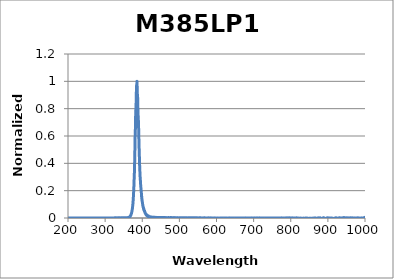
| Category | Normalized Intensity |
|---|---|
| 199.97546 | 0 |
| 200.17692 | 0 |
| 200.37839 | 0 |
| 200.57989 | 0 |
| 200.7814 | 0 |
| 200.98293 | 0 |
| 201.18448 | 0 |
| 201.38605 | 0 |
| 201.58764 | 0 |
| 201.78925 | 0 |
| 201.99087 | 0 |
| 202.19252 | 0 |
| 202.39418 | 0 |
| 202.59586 | 0 |
| 202.79756 | 0 |
| 202.99928 | 0 |
| 203.20102 | 0 |
| 203.40278 | 0 |
| 203.60455 | 0 |
| 203.80635 | 0 |
| 204.00816 | 0 |
| 204.20999 | 0 |
| 204.41184 | 0 |
| 204.61371 | 0 |
| 204.8156 | 0 |
| 205.0175 | 0 |
| 205.21943 | 0 |
| 205.42137 | 0 |
| 205.62334 | 0 |
| 205.82532 | 0 |
| 206.02732 | 0 |
| 206.22934 | 0 |
| 206.43137 | 0 |
| 206.63343 | 0 |
| 206.83551 | 0 |
| 207.0376 | 0 |
| 207.23971 | 0 |
| 207.44184 | 0 |
| 207.64399 | 0 |
| 207.84616 | 0 |
| 208.04835 | 0 |
| 208.25055 | 0 |
| 208.45278 | 0 |
| 208.65502 | 0 |
| 208.85728 | 0 |
| 209.05956 | 0 |
| 209.26186 | 0 |
| 209.46418 | 0 |
| 209.66651 | 0 |
| 209.86887 | 0 |
| 210.07124 | 0 |
| 210.27363 | 0 |
| 210.47604 | 0 |
| 210.67847 | 0 |
| 210.88092 | 0 |
| 211.08338 | 0 |
| 211.28587 | 0 |
| 211.48837 | 0 |
| 211.69089 | 0 |
| 211.89343 | 0 |
| 212.09599 | 0 |
| 212.29857 | 0 |
| 212.50117 | 0 |
| 212.70378 | 0 |
| 212.90641 | 0 |
| 213.10907 | 0 |
| 213.31174 | 0 |
| 213.51442 | 0 |
| 213.71713 | 0 |
| 213.91986 | 0 |
| 214.1226 | 0 |
| 214.32537 | 0 |
| 214.52815 | 0 |
| 214.73095 | 0 |
| 214.93376 | 0 |
| 215.1366 | 0 |
| 215.33946 | 0 |
| 215.54233 | 0 |
| 215.74522 | 0 |
| 215.94813 | 0 |
| 216.15106 | 0 |
| 216.35401 | 0 |
| 216.55698 | 0 |
| 216.75996 | 0 |
| 216.96297 | 0 |
| 217.16599 | 0 |
| 217.36903 | 0 |
| 217.57209 | 0 |
| 217.77517 | 0 |
| 217.97826 | 0 |
| 218.18138 | 0 |
| 218.38451 | 0 |
| 218.58766 | 0 |
| 218.79083 | 0 |
| 218.99402 | 0 |
| 219.19722 | 0 |
| 219.40045 | 0 |
| 219.60369 | 0 |
| 219.80695 | 0 |
| 220.01023 | 0 |
| 220.21353 | 0 |
| 220.41685 | 0 |
| 220.62018 | 0 |
| 220.82354 | 0 |
| 221.02691 | 0 |
| 221.2303 | 0 |
| 221.43371 | 0 |
| 221.63713 | 0 |
| 221.84058 | 0 |
| 222.04404 | 0 |
| 222.24753 | 0 |
| 222.45103 | 0 |
| 222.65455 | 0 |
| 222.85808 | 0 |
| 223.06164 | 0 |
| 223.26521 | 0 |
| 223.46881 | 0 |
| 223.67242 | 0 |
| 223.87605 | 0 |
| 224.07969 | 0 |
| 224.28336 | 0 |
| 224.48704 | 0 |
| 224.69075 | 0 |
| 224.89447 | 0 |
| 225.0982 | 0 |
| 225.30196 | 0 |
| 225.50574 | 0 |
| 225.70953 | 0 |
| 225.91334 | 0 |
| 226.11717 | 0 |
| 226.32102 | 0 |
| 226.52489 | 0 |
| 226.72878 | 0 |
| 226.93268 | 0 |
| 227.1366 | 0 |
| 227.34054 | 0 |
| 227.5445 | 0 |
| 227.74848 | 0 |
| 227.95247 | 0 |
| 228.15649 | 0 |
| 228.36052 | 0 |
| 228.56457 | 0 |
| 228.76863 | 0 |
| 228.97272 | 0 |
| 229.17683 | 0 |
| 229.38095 | 0 |
| 229.58509 | 0 |
| 229.78925 | 0 |
| 229.99343 | 0 |
| 230.19762 | 0 |
| 230.40183 | 0 |
| 230.60607 | 0 |
| 230.81032 | 0 |
| 231.01459 | 0 |
| 231.21887 | 0 |
| 231.42318 | 0 |
| 231.6275 | 0 |
| 231.83184 | 0 |
| 232.0362 | 0 |
| 232.24058 | 0 |
| 232.44497 | 0 |
| 232.64939 | 0 |
| 232.85382 | 0 |
| 233.05827 | 0 |
| 233.26274 | 0 |
| 233.46722 | 0 |
| 233.67173 | 0 |
| 233.87625 | 0 |
| 234.08079 | 0 |
| 234.28535 | 0 |
| 234.48993 | 0 |
| 234.69452 | 0 |
| 234.89914 | 0 |
| 235.10377 | 0 |
| 235.30842 | 0 |
| 235.51309 | 0 |
| 235.71777 | 0 |
| 235.92248 | 0 |
| 236.1272 | 0 |
| 236.33194 | 0 |
| 236.5367 | 0 |
| 236.74147 | 0 |
| 236.94627 | 0 |
| 237.15108 | 0 |
| 237.35591 | 0 |
| 237.56076 | 0 |
| 237.76563 | 0 |
| 237.97051 | 0 |
| 238.17541 | 0 |
| 238.38033 | 0 |
| 238.58527 | 0 |
| 238.79023 | 0 |
| 238.9952 | 0 |
| 239.2002 | 0 |
| 239.40521 | 0 |
| 239.61024 | 0 |
| 239.81529 | 0 |
| 240.02035 | 0 |
| 240.22543 | 0 |
| 240.43053 | 0 |
| 240.63565 | 0 |
| 240.84079 | 0 |
| 241.04595 | 0 |
| 241.25112 | 0 |
| 241.45631 | 0 |
| 241.66152 | 0 |
| 241.86675 | 0 |
| 242.07199 | 0 |
| 242.27726 | 0 |
| 242.48254 | 0 |
| 242.68784 | 0 |
| 242.89315 | 0 |
| 243.09849 | 0 |
| 243.30384 | 0 |
| 243.50921 | 0 |
| 243.7146 | 0 |
| 243.92001 | 0 |
| 244.12543 | 0 |
| 244.33087 | 0 |
| 244.53633 | 0 |
| 244.74181 | 0 |
| 244.94731 | 0 |
| 245.15282 | 0 |
| 245.35836 | 0 |
| 245.56391 | 0 |
| 245.76948 | 0 |
| 245.97506 | 0 |
| 246.18067 | 0 |
| 246.38629 | 0 |
| 246.59193 | 0 |
| 246.79758 | 0 |
| 247.00326 | 0 |
| 247.20895 | 0 |
| 247.41466 | 0 |
| 247.62039 | 0 |
| 247.82614 | 0 |
| 248.03191 | 0 |
| 248.23769 | 0 |
| 248.44349 | 0 |
| 248.64931 | 0 |
| 248.85514 | 0 |
| 249.061 | 0 |
| 249.26687 | 0 |
| 249.47276 | 0 |
| 249.67867 | 0 |
| 249.88459 | 0 |
| 250.09054 | 0 |
| 250.2965 | 0 |
| 250.50248 | 0 |
| 250.70847 | 0 |
| 250.91449 | 0 |
| 251.12052 | 0 |
| 251.32657 | 0 |
| 251.53264 | 0 |
| 251.73872 | 0 |
| 251.94483 | 0 |
| 252.15095 | 0 |
| 252.35709 | 0 |
| 252.56325 | 0 |
| 252.76942 | 0 |
| 252.97561 | 0 |
| 253.18182 | 0 |
| 253.38805 | 0 |
| 253.5943 | 0 |
| 253.80056 | 0 |
| 254.00684 | 0 |
| 254.21314 | 0 |
| 254.41946 | 0 |
| 254.62579 | 0 |
| 254.83214 | 0 |
| 255.03851 | 0 |
| 255.2449 | 0 |
| 255.45131 | 0 |
| 255.65773 | 0 |
| 255.86417 | 0 |
| 256.07063 | 0 |
| 256.27711 | 0 |
| 256.4836 | 0 |
| 256.69011 | 0 |
| 256.89664 | 0 |
| 257.10319 | 0 |
| 257.30975 | 0 |
| 257.51634 | 0 |
| 257.72294 | 0 |
| 257.92955 | 0 |
| 258.13619 | 0 |
| 258.34284 | 0 |
| 258.54951 | 0 |
| 258.7562 | 0 |
| 258.96291 | 0 |
| 259.16963 | 0 |
| 259.37637 | 0 |
| 259.58313 | 0 |
| 259.78991 | 0 |
| 259.9967 | 0 |
| 260.20351 | 0 |
| 260.41034 | 0 |
| 260.61719 | 0 |
| 260.82406 | 0 |
| 261.03094 | 0 |
| 261.23784 | 0 |
| 261.44476 | 0 |
| 261.65169 | 0 |
| 261.85864 | 0 |
| 262.06561 | 0 |
| 262.2726 | 0 |
| 262.47961 | 0 |
| 262.68663 | 0 |
| 262.89367 | 0 |
| 263.10073 | 0 |
| 263.30781 | 0 |
| 263.5149 | 0 |
| 263.72201 | 0 |
| 263.92914 | 0 |
| 264.13629 | 0 |
| 264.34345 | 0 |
| 264.55063 | 0 |
| 264.75783 | 0 |
| 264.96505 | 0 |
| 265.17228 | 0 |
| 265.37953 | 0 |
| 265.5868 | 0 |
| 265.79409 | 0 |
| 266.00139 | 0 |
| 266.20871 | 0 |
| 266.41605 | 0 |
| 266.62341 | 0 |
| 266.83078 | 0 |
| 267.03817 | 0 |
| 267.24558 | 0 |
| 267.45301 | 0 |
| 267.66045 | 0 |
| 267.86791 | 0 |
| 268.07539 | 0 |
| 268.28289 | 0 |
| 268.4904 | 0 |
| 268.69793 | 0 |
| 268.90548 | 0 |
| 269.11305 | 0 |
| 269.32063 | 0 |
| 269.52823 | 0 |
| 269.73585 | 0 |
| 269.94349 | 0 |
| 270.15114 | 0 |
| 270.35881 | 0 |
| 270.5665 | 0 |
| 270.77421 | 0 |
| 270.98193 | 0 |
| 271.18967 | 0 |
| 271.39743 | 0 |
| 271.60521 | 0 |
| 271.813 | 0 |
| 272.02081 | 0 |
| 272.22864 | 0 |
| 272.43648 | 0 |
| 272.64434 | 0 |
| 272.85222 | 0 |
| 273.06012 | 0 |
| 273.26804 | 0 |
| 273.47597 | 0 |
| 273.68392 | 0 |
| 273.89188 | 0 |
| 274.09987 | 0 |
| 274.30787 | 0 |
| 274.51589 | 0 |
| 274.72392 | 0 |
| 274.93198 | 0 |
| 275.14005 | 0 |
| 275.34814 | 0 |
| 275.55624 | 0 |
| 275.76437 | 0 |
| 275.97251 | 0 |
| 276.18066 | 0 |
| 276.38884 | 0 |
| 276.59703 | 0 |
| 276.80524 | 0 |
| 277.01347 | 0 |
| 277.22171 | 0 |
| 277.42997 | 0 |
| 277.63825 | 0 |
| 277.84655 | 0 |
| 278.05486 | 0 |
| 278.26319 | 0 |
| 278.47154 | 0 |
| 278.6799 | 0 |
| 278.88829 | 0 |
| 279.09669 | 0 |
| 279.3051 | 0 |
| 279.51354 | 0 |
| 279.72199 | 0 |
| 279.93046 | 0 |
| 280.13894 | 0 |
| 280.34745 | 0 |
| 280.55597 | 0 |
| 280.7645 | 0 |
| 280.97306 | 0 |
| 281.18163 | 0 |
| 281.39022 | 0 |
| 281.59883 | 0 |
| 281.80745 | 0 |
| 282.01609 | 0 |
| 282.22475 | 0 |
| 282.43342 | 0 |
| 282.64212 | 0 |
| 282.85083 | 0 |
| 283.05955 | 0 |
| 283.2683 | 0 |
| 283.47706 | 0 |
| 283.68584 | 0 |
| 283.89463 | 0 |
| 284.10345 | 0 |
| 284.31228 | 0 |
| 284.52112 | 0 |
| 284.72999 | 0 |
| 284.93887 | 0 |
| 285.14777 | 0 |
| 285.35668 | 0 |
| 285.56562 | 0 |
| 285.77457 | 0 |
| 285.98353 | 0 |
| 286.19252 | 0 |
| 286.40152 | 0 |
| 286.61054 | 0 |
| 286.81957 | 0 |
| 287.02863 | 0 |
| 287.2377 | 0 |
| 287.44678 | 0 |
| 287.65589 | 0 |
| 287.86501 | 0 |
| 288.07415 | 0 |
| 288.2833 | 0 |
| 288.49248 | 0 |
| 288.70167 | 0 |
| 288.91087 | 0 |
| 289.1201 | 0 |
| 289.32934 | 0 |
| 289.53859 | 0 |
| 289.74787 | 0 |
| 289.95716 | 0 |
| 290.16647 | 0 |
| 290.3758 | 0 |
| 290.58514 | 0 |
| 290.7945 | 0 |
| 291.00388 | 0 |
| 291.21327 | 0 |
| 291.42268 | 0 |
| 291.63211 | 0 |
| 291.84156 | 0 |
| 292.05102 | 0 |
| 292.2605 | 0 |
| 292.47 | 0 |
| 292.67951 | 0 |
| 292.88904 | 0 |
| 293.09859 | 0 |
| 293.30815 | 0 |
| 293.51773 | 0 |
| 293.72733 | 0 |
| 293.93695 | 0 |
| 294.14658 | 0 |
| 294.35623 | 0 |
| 294.56589 | 0 |
| 294.77558 | 0 |
| 294.98528 | 0 |
| 295.195 | 0 |
| 295.40473 | 0 |
| 295.61448 | 0 |
| 295.82425 | 0 |
| 296.03403 | 0 |
| 296.24384 | 0 |
| 296.45366 | 0 |
| 296.66349 | 0 |
| 296.87334 | 0 |
| 297.08321 | 0 |
| 297.2931 | 0 |
| 297.503 | 0 |
| 297.71292 | 0 |
| 297.92286 | 0 |
| 298.13282 | 0 |
| 298.34279 | 0 |
| 298.55277 | 0 |
| 298.76278 | 0 |
| 298.9728 | 0 |
| 299.18284 | 0 |
| 299.3929 | 0 |
| 299.60297 | 0 |
| 299.81306 | 0 |
| 300.02316 | 0 |
| 300.23329 | 0 |
| 300.44343 | 0 |
| 300.65358 | 0 |
| 300.86376 | 0 |
| 301.07395 | 0 |
| 301.28416 | 0 |
| 301.49438 | 0 |
| 301.70462 | 0 |
| 301.91488 | 0 |
| 302.12515 | 0 |
| 302.33544 | 0 |
| 302.54575 | 0 |
| 302.75608 | 0 |
| 302.96642 | 0 |
| 303.17678 | 0 |
| 303.38715 | 0 |
| 303.59755 | 0 |
| 303.80796 | 0 |
| 304.01838 | 0 |
| 304.22882 | 0 |
| 304.43928 | 0 |
| 304.64976 | 0 |
| 304.86025 | 0 |
| 305.07076 | 0 |
| 305.28129 | 0 |
| 305.49183 | 0 |
| 305.70239 | 0 |
| 305.91297 | 0 |
| 306.12356 | 0 |
| 306.33417 | 0 |
| 306.5448 | 0 |
| 306.75545 | 0 |
| 306.96611 | 0 |
| 307.17678 | 0 |
| 307.38748 | 0 |
| 307.59819 | 0 |
| 307.80892 | 0 |
| 308.01966 | 0 |
| 308.23042 | 0 |
| 308.4412 | 0 |
| 308.65199 | 0 |
| 308.8628 | 0 |
| 309.07363 | 0 |
| 309.28448 | 0 |
| 309.49534 | 0 |
| 309.70622 | 0 |
| 309.91711 | 0 |
| 310.12802 | 0 |
| 310.33895 | 0 |
| 310.54989 | 0 |
| 310.76085 | 0 |
| 310.97183 | 0 |
| 311.18283 | 0 |
| 311.39384 | 0 |
| 311.60487 | 0 |
| 311.81591 | 0 |
| 312.02697 | 0 |
| 312.23805 | 0 |
| 312.44914 | 0 |
| 312.66025 | 0 |
| 312.87138 | 0 |
| 313.08253 | 0 |
| 313.29369 | 0 |
| 313.50486 | 0 |
| 313.71606 | 0 |
| 313.92727 | 0 |
| 314.1385 | 0 |
| 314.34974 | 0 |
| 314.561 | 0 |
| 314.77228 | 0 |
| 314.98357 | 0 |
| 315.19488 | 0 |
| 315.40621 | 0 |
| 315.61755 | 0 |
| 315.82891 | 0 |
| 316.04029 | 0 |
| 316.25168 | 0 |
| 316.46309 | 0 |
| 316.67452 | 0 |
| 316.88596 | 0 |
| 317.09742 | 0 |
| 317.3089 | 0 |
| 317.52039 | 0 |
| 317.7319 | 0 |
| 317.94342 | 0 |
| 318.15496 | 0 |
| 318.36652 | 0 |
| 318.5781 | 0 |
| 318.78969 | 0 |
| 319.0013 | 0 |
| 319.21292 | 0 |
| 319.42456 | 0 |
| 319.63622 | 0 |
| 319.84789 | 0 |
| 320.05958 | 0 |
| 320.27129 | 0 |
| 320.48302 | 0 |
| 320.69476 | 0 |
| 320.90651 | 0 |
| 321.11828 | 0 |
| 321.33007 | 0 |
| 321.54188 | 0 |
| 321.7537 | 0 |
| 321.96554 | 0 |
| 322.1774 | 0 |
| 322.38927 | 0 |
| 322.60116 | 0 |
| 322.81306 | 0 |
| 323.02498 | 0 |
| 323.23692 | 0 |
| 323.44887 | 0 |
| 323.66084 | 0 |
| 323.87283 | 0 |
| 324.08483 | 0 |
| 324.29685 | 0 |
| 324.50889 | 0 |
| 324.72094 | 0 |
| 324.93301 | 0.001 |
| 325.14509 | 0 |
| 325.35719 | 0.001 |
| 325.56931 | 0 |
| 325.78145 | 0.001 |
| 325.9936 | 0 |
| 326.20576 | 0 |
| 326.41795 | 0 |
| 326.63015 | 0.001 |
| 326.84236 | -0.001 |
| 327.0546 | 0 |
| 327.26684 | 0 |
| 327.47911 | 0.001 |
| 327.69139 | -0.001 |
| 327.90369 | 0.001 |
| 328.116 | 0 |
| 328.32833 | 0 |
| 328.54068 | -0.001 |
| 328.75304 | 0.001 |
| 328.96542 | 0 |
| 329.17782 | 0.001 |
| 329.39023 | 0 |
| 329.60266 | 0 |
| 329.8151 | -0.001 |
| 330.02756 | 0.001 |
| 330.24004 | -0.001 |
| 330.45253 | 0.001 |
| 330.66504 | -0.001 |
| 330.87757 | 0.001 |
| 331.09011 | 0 |
| 331.30267 | 0.001 |
| 331.51525 | -0.001 |
| 331.72784 | 0.001 |
| 331.94045 | 0 |
| 332.15307 | 0.001 |
| 332.36571 | -0.001 |
| 332.57837 | 0 |
| 332.79104 | 0 |
| 333.00373 | 0.001 |
| 333.21643 | 0 |
| 333.42915 | 0.001 |
| 333.64189 | 0 |
| 333.85464 | 0.001 |
| 334.06741 | 0 |
| 334.2802 | 0 |
| 334.493 | 0 |
| 334.70582 | 0.001 |
| 334.91866 | 0 |
| 335.13151 | 0.002 |
| 335.34437 | 0 |
| 335.55726 | 0 |
| 335.77016 | -0.001 |
| 335.98307 | 0 |
| 336.196 | 0 |
| 336.40895 | 0.001 |
| 336.62192 | 0 |
| 336.8349 | 0.001 |
| 337.04789 | 0 |
| 337.26091 | 0.001 |
| 337.47394 | 0 |
| 337.68698 | 0.001 |
| 337.90004 | -0.001 |
| 338.11312 | 0 |
| 338.32621 | 0 |
| 338.53932 | 0.001 |
| 338.75245 | 0 |
| 338.96559 | 0.001 |
| 339.17875 | -0.001 |
| 339.39192 | 0 |
| 339.60511 | 0 |
| 339.81832 | 0 |
| 340.03154 | 0 |
| 340.24478 | 0.001 |
| 340.45804 | 0 |
| 340.67131 | 0.001 |
| 340.88459 | 0 |
| 341.0979 | 0.001 |
| 341.31122 | 0 |
| 341.52455 | 0.001 |
| 341.7379 | 0 |
| 341.95127 | 0.001 |
| 342.16465 | 0 |
| 342.37805 | 0.001 |
| 342.59147 | -0.001 |
| 342.8049 | 0.001 |
| 343.01835 | 0 |
| 343.23181 | 0.001 |
| 343.44529 | 0 |
| 343.65879 | 0.001 |
| 343.8723 | -0.001 |
| 344.08583 | 0.001 |
| 344.29937 | 0 |
| 344.51293 | 0.001 |
| 344.72651 | -0.001 |
| 344.9401 | 0.001 |
| 345.15371 | 0.001 |
| 345.36733 | 0.002 |
| 345.58097 | -0.001 |
| 345.79463 | 0.001 |
| 346.0083 | -0.001 |
| 346.22199 | 0.001 |
| 346.43569 | 0 |
| 346.64941 | 0.002 |
| 346.86315 | 0 |
| 347.0769 | 0.001 |
| 347.29067 | 0 |
| 347.50446 | 0.002 |
| 347.71826 | 0 |
| 347.93207 | 0.001 |
| 348.1459 | 0 |
| 348.35975 | 0.001 |
| 348.57362 | -0.001 |
| 348.78749 | 0.001 |
| 349.00139 | 0 |
| 349.2153 | 0.001 |
| 349.42923 | 0 |
| 349.64317 | 0.001 |
| 349.85713 | 0 |
| 350.07111 | 0.001 |
| 350.2851 | 0 |
| 350.49911 | 0.001 |
| 350.71313 | -0.001 |
| 350.92717 | 0.001 |
| 351.14122 | 0 |
| 351.3553 | 0.001 |
| 351.56938 | 0 |
| 351.78349 | 0.001 |
| 351.9976 | 0 |
| 352.21174 | 0.001 |
| 352.42589 | 0 |
| 352.64005 | 0.001 |
| 352.85424 | 0.001 |
| 353.06844 | 0.002 |
| 353.28265 | 0 |
| 353.49688 | 0.002 |
| 353.71112 | 0 |
| 353.92539 | 0.001 |
| 354.13966 | 0 |
| 354.35396 | 0.001 |
| 354.56827 | 0 |
| 354.78259 | 0.001 |
| 354.99693 | 0 |
| 355.21129 | 0.001 |
| 355.42566 | 0 |
| 355.64005 | 0.001 |
| 355.85445 | 0 |
| 356.06887 | 0.002 |
| 356.28331 | 0 |
| 356.49776 | 0.001 |
| 356.71223 | 0 |
| 356.92671 | 0.001 |
| 357.14121 | 0 |
| 357.35572 | 0.002 |
| 357.57025 | 0 |
| 357.7848 | 0.001 |
| 357.99936 | 0 |
| 358.21394 | 0.001 |
| 358.42853 | 0.001 |
| 358.64314 | 0.003 |
| 358.85777 | 0.001 |
| 359.07241 | 0.002 |
| 359.28706 | 0.001 |
| 359.50173 | 0.002 |
| 359.71642 | 0.001 |
| 359.93113 | 0.003 |
| 360.14585 | 0.001 |
| 360.36058 | 0.002 |
| 360.57533 | 0.001 |
| 360.7901 | 0.002 |
| 361.00488 | 0.001 |
| 361.21968 | 0.003 |
| 361.43449 | 0.001 |
| 361.64932 | 0.003 |
| 361.86417 | 0.002 |
| 362.07903 | 0.003 |
| 362.29391 | 0.001 |
| 362.5088 | 0.003 |
| 362.72371 | 0.002 |
| 362.93863 | 0.004 |
| 363.15357 | 0.003 |
| 363.36852 | 0.004 |
| 363.58349 | 0.003 |
| 363.79848 | 0.005 |
| 364.01348 | 0.004 |
| 364.2285 | 0.005 |
| 364.44353 | 0.003 |
| 364.65858 | 0.006 |
| 364.87365 | 0.004 |
| 365.08873 | 0.007 |
| 365.30382 | 0.006 |
| 365.51894 | 0.008 |
| 365.73406 | 0.007 |
| 365.94921 | 0.007 |
| 366.16436 | 0.007 |
| 366.37954 | 0.01 |
| 366.59473 | 0.01 |
| 366.80993 | 0.011 |
| 367.02515 | 0.01 |
| 367.24039 | 0.012 |
| 367.45564 | 0.012 |
| 367.67091 | 0.014 |
| 367.88619 | 0.013 |
| 368.10149 | 0.016 |
| 368.31681 | 0.015 |
| 368.53214 | 0.018 |
| 368.74748 | 0.017 |
| 368.96285 | 0.02 |
| 369.17822 | 0.02 |
| 369.39361 | 0.023 |
| 369.60902 | 0.023 |
| 369.82445 | 0.025 |
| 370.03989 | 0.026 |
| 370.25534 | 0.029 |
| 370.47081 | 0.03 |
| 370.6863 | 0.032 |
| 370.9018 | 0.033 |
| 371.11731 | 0.036 |
| 371.33285 | 0.037 |
| 371.54839 | 0.041 |
| 371.76396 | 0.042 |
| 371.97954 | 0.046 |
| 372.19513 | 0.048 |
| 372.41074 | 0.052 |
| 372.62637 | 0.055 |
| 372.84201 | 0.059 |
| 373.05766 | 0.062 |
| 373.27334 | 0.066 |
| 373.48902 | 0.07 |
| 373.70473 | 0.076 |
| 373.92044 | 0.079 |
| 374.13618 | 0.086 |
| 374.35193 | 0.091 |
| 374.56769 | 0.098 |
| 374.78347 | 0.102 |
| 374.99927 | 0.109 |
| 375.21508 | 0.116 |
| 375.43091 | 0.126 |
| 375.64675 | 0.133 |
| 375.86261 | 0.143 |
| 376.07848 | 0.152 |
| 376.29437 | 0.162 |
| 376.51027 | 0.172 |
| 376.72619 | 0.186 |
| 376.94213 | 0.196 |
| 377.15808 | 0.211 |
| 377.37404 | 0.225 |
| 377.59002 | 0.239 |
| 377.80602 | 0.258 |
| 378.02203 | 0.277 |
| 378.23806 | 0.286 |
| 378.4541 | 0.3 |
| 378.67016 | 0.314 |
| 378.88623 | 0.337 |
| 379.10232 | 0.363 |
| 379.31842 | 0.39 |
| 379.53454 | 0.414 |
| 379.75068 | 0.443 |
| 379.96683 | 0.47 |
| 380.183 | 0.499 |
| 380.39918 | 0.528 |
| 380.61537 | 0.562 |
| 380.83158 | 0.598 |
| 381.04781 | 0.633 |
| 381.26405 | 0.639 |
| 381.48031 | 0.647 |
| 381.69659 | 0.682 |
| 381.91287 | 0.72 |
| 382.12918 | 0.744 |
| 382.3455 | 0.758 |
| 382.56183 | 0.754 |
| 382.77818 | 0.791 |
| 382.99455 | 0.789 |
| 383.21093 | 0.813 |
| 383.42732 | 0.825 |
| 383.64373 | 0.865 |
| 383.86016 | 0.877 |
| 384.0766 | 0.919 |
| 384.29306 | 0.924 |
| 384.50953 | 0.95 |
| 384.72602 | 0.963 |
| 384.94252 | 0.976 |
| 385.15904 | 0.973 |
| 385.37557 | 0.981 |
| 385.59212 | 0.984 |
| 385.80868 | 1 |
| 386.02526 | 0.975 |
| 386.24186 | 0.964 |
| 386.45847 | 0.95 |
| 386.67509 | 0.952 |
| 386.89173 | 0.905 |
| 387.10839 | 0.895 |
| 387.32506 | 0.877 |
| 387.54174 | 0.888 |
| 387.75844 | 0.845 |
| 387.97516 | 0.845 |
| 388.19189 | 0.81 |
| 388.40864 | 0.797 |
| 388.6254 | 0.768 |
| 388.84218 | 0.757 |
| 389.05897 | 0.733 |
| 389.27578 | 0.737 |
| 389.4926 | 0.715 |
| 389.70944 | 0.713 |
| 389.92629 | 0.686 |
| 390.14316 | 0.668 |
| 390.36004 | 0.644 |
| 390.57694 | 0.628 |
| 390.79385 | 0.585 |
| 391.01078 | 0.576 |
| 391.22773 | 0.54 |
| 391.44469 | 0.527 |
| 391.66166 | 0.5 |
| 391.87865 | 0.489 |
| 392.09566 | 0.46 |
| 392.31268 | 0.446 |
| 392.52971 | 0.423 |
| 392.74676 | 0.404 |
| 392.96383 | 0.383 |
| 393.18091 | 0.372 |
| 393.398 | 0.351 |
| 393.61511 | 0.34 |
| 393.83224 | 0.324 |
| 394.04938 | 0.32 |
| 394.26653 | 0.301 |
| 394.48371 | 0.298 |
| 394.70089 | 0.283 |
| 394.91809 | 0.276 |
| 395.13531 | 0.268 |
| 395.35254 | 0.261 |
| 395.56979 | 0.247 |
| 395.78705 | 0.24 |
| 396.00433 | 0.23 |
| 396.22162 | 0.228 |
| 396.43892 | 0.215 |
| 396.65625 | 0.213 |
| 396.87358 | 0.205 |
| 397.09094 | 0.199 |
| 397.3083 | 0.186 |
| 397.52568 | 0.189 |
| 397.74308 | 0.178 |
| 397.96049 | 0.172 |
| 398.17792 | 0.156 |
| 398.39536 | 0.159 |
| 398.61282 | 0.145 |
| 398.83029 | 0.146 |
| 399.04778 | 0.136 |
| 399.26528 | 0.139 |
| 399.4828 | 0.126 |
| 399.70033 | 0.126 |
| 399.91788 | 0.121 |
| 400.13544 | 0.121 |
| 400.35302 | 0.114 |
| 400.57061 | 0.111 |
| 400.78822 | 0.104 |
| 401.00584 | 0.102 |
| 401.22348 | 0.098 |
| 401.44113 | 0.097 |
| 401.6588 | 0.088 |
| 401.87648 | 0.089 |
| 402.09418 | 0.082 |
| 402.31189 | 0.085 |
| 402.52962 | 0.078 |
| 402.74736 | 0.079 |
| 402.96512 | 0.075 |
| 403.18289 | 0.077 |
| 403.40067 | 0.068 |
| 403.61848 | 0.068 |
| 403.83629 | 0.066 |
| 404.05412 | 0.068 |
| 404.27197 | 0.062 |
| 404.48983 | 0.062 |
| 404.70771 | 0.056 |
| 404.9256 | 0.058 |
| 405.14351 | 0.055 |
| 405.36143 | 0.054 |
| 405.57936 | 0.051 |
| 405.79731 | 0.053 |
| 406.01528 | 0.048 |
| 406.23326 | 0.052 |
| 406.45126 | 0.046 |
| 406.66927 | 0.046 |
| 406.88729 | 0.044 |
| 407.10533 | 0.044 |
| 407.32339 | 0.039 |
| 407.54146 | 0.043 |
| 407.75954 | 0.037 |
| 407.97764 | 0.038 |
| 408.19576 | 0.035 |
| 408.41389 | 0.033 |
| 408.63203 | 0.034 |
| 408.85019 | 0.031 |
| 409.06836 | 0.033 |
| 409.28655 | 0.028 |
| 409.50476 | 0.031 |
| 409.72297 | 0.026 |
| 409.94121 | 0.03 |
| 410.15946 | 0.025 |
| 410.37772 | 0.028 |
| 410.596 | 0.024 |
| 410.81429 | 0.026 |
| 411.0326 | 0.021 |
| 411.25092 | 0.025 |
| 411.46925 | 0.022 |
| 411.68761 | 0.024 |
| 411.90597 | 0.019 |
| 412.12435 | 0.023 |
| 412.34275 | 0.018 |
| 412.56116 | 0.02 |
| 412.77959 | 0.016 |
| 412.99803 | 0.02 |
| 413.21648 | 0.017 |
| 413.43495 | 0.019 |
| 413.65344 | 0.015 |
| 413.87193 | 0.018 |
| 414.09045 | 0.016 |
| 414.30898 | 0.017 |
| 414.52752 | 0.013 |
| 414.74608 | 0.015 |
| 414.96465 | 0.012 |
| 415.18324 | 0.015 |
| 415.40184 | 0.013 |
| 415.62046 | 0.015 |
| 415.83909 | 0.011 |
| 416.05774 | 0.014 |
| 416.2764 | 0.012 |
| 416.49508 | 0.014 |
| 416.71377 | 0.011 |
| 416.93247 | 0.015 |
| 417.15119 | 0.01 |
| 417.36993 | 0.011 |
| 417.58868 | 0.01 |
| 417.80744 | 0.012 |
| 418.02622 | 0.01 |
| 418.24501 | 0.011 |
| 418.46382 | 0.008 |
| 418.68264 | 0.012 |
| 418.90148 | 0.007 |
| 419.12033 | 0.01 |
| 419.3392 | 0.008 |
| 419.55808 | 0.01 |
| 419.77698 | 0.008 |
| 419.99589 | 0.009 |
| 420.21481 | 0.006 |
| 420.43375 | 0.009 |
| 420.65271 | 0.007 |
| 420.87167 | 0.008 |
| 421.09066 | 0.006 |
| 421.30966 | 0.009 |
| 421.52867 | 0.005 |
| 421.7477 | 0.008 |
| 421.96674 | 0.006 |
| 422.1858 | 0.008 |
| 422.40487 | 0.006 |
| 422.62395 | 0.007 |
| 422.84305 | 0.005 |
| 423.06217 | 0.007 |
| 423.2813 | 0.005 |
| 423.50044 | 0.006 |
| 423.7196 | 0.004 |
| 423.93878 | 0.007 |
| 424.15796 | 0.004 |
| 424.37717 | 0.007 |
| 424.59638 | 0.004 |
| 424.81561 | 0.007 |
| 425.03486 | 0.004 |
| 425.25412 | 0.007 |
| 425.4734 | 0.003 |
| 425.69269 | 0.007 |
| 425.91199 | 0.003 |
| 426.13131 | 0.006 |
| 426.35064 | 0.005 |
| 426.56999 | 0.006 |
| 426.78935 | 0.004 |
| 427.00873 | 0.005 |
| 427.22812 | 0.003 |
| 427.44753 | 0.006 |
| 427.66695 | 0.003 |
| 427.88638 | 0.005 |
| 428.10583 | 0.003 |
| 428.3253 | 0.005 |
| 428.54477 | 0.002 |
| 428.76427 | 0.005 |
| 428.98377 | 0.003 |
| 429.2033 | 0.006 |
| 429.42283 | 0.004 |
| 429.64238 | 0.005 |
| 429.86195 | 0.001 |
| 430.08153 | 0.005 |
| 430.30112 | 0.001 |
| 430.52073 | 0.005 |
| 430.74035 | 0.003 |
| 430.95999 | 0.005 |
| 431.17964 | 0.002 |
| 431.39931 | 0.004 |
| 431.61899 | 0.002 |
| 431.83868 | 0.004 |
| 432.05839 | 0.002 |
| 432.27812 | 0.005 |
| 432.49785 | 0.003 |
| 432.71761 | 0.005 |
| 432.93737 | 0.002 |
| 433.15716 | 0.004 |
| 433.37695 | 0.001 |
| 433.59676 | 0.004 |
| 433.81659 | 0.002 |
| 434.03643 | 0.004 |
| 434.25628 | 0.001 |
| 434.47615 | 0.005 |
| 434.69603 | 0.001 |
| 434.91593 | 0.004 |
| 435.13584 | 0.002 |
| 435.35576 | 0.003 |
| 435.5757 | 0.001 |
| 435.79565 | 0.003 |
| 436.01562 | 0.001 |
| 436.23561 | 0.004 |
| 436.4556 | 0.001 |
| 436.67561 | 0.003 |
| 436.89564 | 0.001 |
| 437.11568 | 0.003 |
| 437.33573 | 0.002 |
| 437.5558 | 0.005 |
| 437.77589 | 0.001 |
| 437.99598 | 0.004 |
| 438.21609 | 0 |
| 438.43622 | 0.003 |
| 438.65636 | 0.002 |
| 438.87651 | 0.004 |
| 439.09668 | 0.002 |
| 439.31687 | 0.003 |
| 439.53706 | 0.002 |
| 439.75727 | 0.002 |
| 439.9775 | 0.001 |
| 440.19774 | 0.004 |
| 440.41799 | 0 |
| 440.63826 | 0.004 |
| 440.85855 | 0.001 |
| 441.07884 | 0.003 |
| 441.29915 | 0.001 |
| 441.51948 | 0.003 |
| 441.73982 | 0.001 |
| 441.96017 | 0.003 |
| 442.18054 | 0 |
| 442.40092 | 0.003 |
| 442.62132 | 0.001 |
| 442.84173 | 0.003 |
| 443.06216 | 0.001 |
| 443.2826 | 0.004 |
| 443.50305 | 0.001 |
| 443.72352 | 0.002 |
| 443.944 | 0 |
| 444.1645 | 0.002 |
| 444.38501 | 0 |
| 444.60553 | 0.002 |
| 444.82607 | 0.001 |
| 445.04662 | 0.003 |
| 445.26719 | 0 |
| 445.48777 | 0.002 |
| 445.70837 | 0.001 |
| 445.92898 | 0.003 |
| 446.1496 | 0.001 |
| 446.37024 | 0.004 |
| 446.59089 | 0.001 |
| 446.81156 | 0.002 |
| 447.03224 | 0.001 |
| 447.25293 | 0.002 |
| 447.47364 | 0 |
| 447.69436 | 0.003 |
| 447.9151 | 0.001 |
| 448.13585 | 0.002 |
| 448.35662 | 0 |
| 448.5774 | 0.003 |
| 448.79819 | 0.001 |
| 449.019 | 0.004 |
| 449.23982 | 0 |
| 449.46065 | 0.003 |
| 449.6815 | 0.001 |
| 449.90237 | 0.003 |
| 450.12325 | 0.002 |
| 450.34414 | 0.003 |
| 450.56504 | 0 |
| 450.78597 | 0.003 |
| 451.0069 | 0.001 |
| 451.22785 | 0.003 |
| 451.44881 | 0.001 |
| 451.66979 | 0.002 |
| 451.89078 | 0 |
| 452.11178 | 0.003 |
| 452.3328 | 0 |
| 452.55383 | 0.003 |
| 452.77488 | 0 |
| 452.99594 | 0.003 |
| 453.21702 | 0.001 |
| 453.43811 | 0.003 |
| 453.65921 | 0.001 |
| 453.88032 | 0.003 |
| 454.10146 | 0 |
| 454.3226 | 0.002 |
| 454.54376 | 0 |
| 454.76493 | 0.003 |
| 454.98612 | 0.001 |
| 455.20732 | 0.003 |
| 455.42854 | 0.001 |
| 455.64976 | 0.002 |
| 455.87101 | 0 |
| 456.09226 | 0.002 |
| 456.31354 | 0 |
| 456.53482 | 0.003 |
| 456.75612 | 0 |
| 456.97743 | 0.002 |
| 457.19876 | 0.001 |
| 457.4201 | 0.003 |
| 457.64145 | 0.002 |
| 457.86282 | 0.002 |
| 458.08421 | 0 |
| 458.3056 | 0.002 |
| 458.52701 | 0.002 |
| 458.74844 | 0.002 |
| 458.96988 | 0.001 |
| 459.19133 | 0.003 |
| 459.41279 | 0.001 |
| 459.63427 | 0.002 |
| 459.85577 | 0 |
| 460.07728 | 0.002 |
| 460.2988 | 0.001 |
| 460.52033 | 0.003 |
| 460.74188 | 0.002 |
| 460.96345 | 0.002 |
| 461.18502 | 0.001 |
| 461.40662 | 0.002 |
| 461.62822 | 0.001 |
| 461.84984 | 0.002 |
| 462.07147 | 0.001 |
| 462.29312 | 0.003 |
| 462.51478 | 0.001 |
| 462.73645 | 0.003 |
| 462.95814 | 0.001 |
| 463.17984 | 0.002 |
| 463.40156 | 0 |
| 463.62329 | 0.002 |
| 463.84503 | 0.001 |
| 464.06679 | 0.003 |
| 464.28856 | 0 |
| 464.51035 | 0.002 |
| 464.73215 | 0.002 |
| 464.95396 | 0.001 |
| 465.17579 | 0.003 |
| 465.39763 | 0.001 |
| 465.61948 | 0.003 |
| 465.84135 | 0.001 |
| 466.06323 | 0.002 |
| 466.28513 | 0.001 |
| 466.50704 | 0.002 |
| 466.72896 | 0.001 |
| 466.9509 | 0.003 |
| 467.17285 | 0.001 |
| 467.39481 | 0.002 |
| 467.61679 | 0 |
| 467.83878 | 0.002 |
| 468.06079 | 0.001 |
| 468.28281 | 0.002 |
| 468.50484 | 0.001 |
| 468.72689 | 0.002 |
| 468.94895 | 0.001 |
| 469.17103 | 0.002 |
| 469.39312 | 0.002 |
| 469.61522 | 0.002 |
| 469.83733 | 0.001 |
| 470.05946 | 0.003 |
| 470.28161 | 0.001 |
| 470.50376 | 0.003 |
| 470.72594 | 0.001 |
| 470.94812 | 0.002 |
| 471.17032 | 0.001 |
| 471.39253 | 0.003 |
| 471.61476 | 0.001 |
| 471.837 | 0.002 |
| 472.05925 | 0.001 |
| 472.28152 | 0.003 |
| 472.5038 | 0.001 |
| 472.72609 | 0.002 |
| 472.9484 | 0.001 |
| 473.17072 | 0.002 |
| 473.39305 | 0 |
| 473.6154 | 0.002 |
| 473.83777 | 0.001 |
| 474.06014 | 0.001 |
| 474.28253 | 0.001 |
| 474.50494 | 0.002 |
| 474.72735 | 0.001 |
| 474.94978 | 0.002 |
| 475.17223 | 0.001 |
| 475.39469 | 0.003 |
| 475.61716 | 0 |
| 475.83964 | 0.003 |
| 476.06214 | 0.002 |
| 476.28465 | 0.002 |
| 476.50718 | 0 |
| 476.72972 | 0.003 |
| 476.95227 | 0.001 |
| 477.17484 | 0.002 |
| 477.39742 | 0.001 |
| 477.62001 | 0.004 |
| 477.84262 | 0.001 |
| 478.06524 | 0.002 |
| 478.28788 | 0 |
| 478.51053 | 0.002 |
| 478.73319 | 0.001 |
| 478.95586 | 0.002 |
| 479.17855 | 0.001 |
| 479.40126 | 0.003 |
| 479.62397 | 0.001 |
| 479.8467 | 0.002 |
| 480.06945 | 0.001 |
| 480.2922 | 0.003 |
| 480.51497 | 0.001 |
| 480.73776 | 0.002 |
| 480.96056 | 0.001 |
| 481.18337 | 0.002 |
| 481.40619 | 0.001 |
| 481.62903 | 0.002 |
| 481.85188 | 0.001 |
| 482.07475 | 0.002 |
| 482.29763 | 0.001 |
| 482.52052 | 0.002 |
| 482.74342 | 0.001 |
| 482.96634 | 0.002 |
| 483.18928 | 0 |
| 483.41222 | 0.002 |
| 483.63518 | 0.001 |
| 483.85815 | 0.003 |
| 484.08114 | 0 |
| 484.30414 | 0.002 |
| 484.52715 | 0 |
| 484.75018 | 0.002 |
| 484.97322 | 0.001 |
| 485.19628 | 0.002 |
| 485.41934 | 0 |
| 485.64242 | 0.002 |
| 485.86552 | 0.001 |
| 486.08863 | 0.003 |
| 486.31175 | 0 |
| 486.53488 | 0.002 |
| 486.75803 | 0 |
| 486.98119 | 0.002 |
| 487.20437 | 0.001 |
| 487.42756 | 0.002 |
| 487.65076 | 0.001 |
| 487.87397 | 0.002 |
| 488.0972 | 0.001 |
| 488.32044 | 0.002 |
| 488.5437 | 0.001 |
| 488.76697 | 0.002 |
| 488.99025 | 0.001 |
| 489.21354 | 0.002 |
| 489.43685 | 0 |
| 489.66018 | 0.002 |
| 489.88351 | 0.001 |
| 490.10686 | 0.002 |
| 490.33022 | 0 |
| 490.5536 | 0.003 |
| 490.77699 | 0.001 |
| 491.00039 | 0.002 |
| 491.22381 | 0 |
| 491.44724 | 0.002 |
| 491.67068 | 0 |
| 491.89413 | 0.002 |
| 492.1176 | 0.001 |
| 492.34109 | 0.002 |
| 492.56458 | 0.001 |
| 492.78809 | 0.002 |
| 493.01161 | 0 |
| 493.23515 | 0.002 |
| 493.4587 | 0 |
| 493.68226 | 0.002 |
| 493.90584 | 0 |
| 494.12943 | 0.002 |
| 494.35303 | 0 |
| 494.57664 | 0.002 |
| 494.80027 | 0 |
| 495.02391 | 0.002 |
| 495.24757 | 0.001 |
| 495.47124 | 0.002 |
| 495.69492 | 0 |
| 495.91862 | 0.003 |
| 496.14232 | 0.001 |
| 496.36605 | 0.002 |
| 496.58978 | 0.001 |
| 496.81353 | 0.002 |
| 497.03729 | 0 |
| 497.26107 | 0.002 |
| 497.48485 | 0 |
| 497.70866 | 0.002 |
| 497.93247 | 0 |
| 498.1563 | 0.002 |
| 498.38014 | 0.001 |
| 498.60399 | 0.001 |
| 498.82786 | 0.001 |
| 499.05174 | 0.002 |
| 499.27564 | 0.001 |
| 499.49954 | 0.002 |
| 499.72346 | 0.001 |
| 499.9474 | 0.002 |
| 500.17134 | 0.001 |
| 500.3953 | 0.001 |
| 500.61928 | 0.001 |
| 500.84326 | 0.002 |
| 501.06726 | 0.001 |
| 501.29127 | 0.002 |
| 501.5153 | 0 |
| 501.73934 | 0.001 |
| 501.96339 | 0.001 |
| 502.18745 | 0.001 |
| 502.41153 | 0.001 |
| 502.63562 | 0.001 |
| 502.85973 | 0.001 |
| 503.08385 | 0.001 |
| 503.30798 | 0.001 |
| 503.53212 | 0.001 |
| 503.75628 | 0.001 |
| 503.98045 | 0.001 |
| 504.20463 | 0.001 |
| 504.42883 | 0.002 |
| 504.65304 | 0.001 |
| 504.87726 | 0.001 |
| 505.1015 | 0.001 |
| 505.32575 | 0.002 |
| 505.55001 | 0.001 |
| 505.77428 | 0.002 |
| 505.99857 | 0.001 |
| 506.22287 | 0.001 |
| 506.44719 | 0.001 |
| 506.67151 | 0.002 |
| 506.89585 | 0.001 |
| 507.12021 | 0.002 |
| 507.34457 | 0.001 |
| 507.56895 | 0.002 |
| 507.79335 | 0.001 |
| 508.01775 | 0.002 |
| 508.24217 | 0.001 |
| 508.4666 | 0.001 |
| 508.69105 | 0.001 |
| 508.91551 | 0.001 |
| 509.13998 | 0.001 |
| 509.36446 | 0.002 |
| 509.58896 | 0.001 |
| 509.81347 | 0.001 |
| 510.03799 | 0 |
| 510.26253 | 0.002 |
| 510.48708 | 0 |
| 510.71164 | 0.002 |
| 510.93621 | 0 |
| 511.1608 | 0.002 |
| 511.3854 | 0 |
| 511.61002 | 0.002 |
| 511.83464 | 0 |
| 512.05928 | 0.002 |
| 512.28394 | 0 |
| 512.5086 | 0.002 |
| 512.73328 | 0 |
| 512.95797 | 0.002 |
| 513.18268 | 0.001 |
| 513.4074 | 0.001 |
| 513.63213 | 0.001 |
| 513.85687 | 0.002 |
| 514.08163 | 0.001 |
| 514.3064 | 0.001 |
| 514.53118 | 0.001 |
| 514.75597 | 0.001 |
| 514.98078 | 0 |
| 515.2056 | 0.002 |
| 515.43044 | 0 |
| 515.65529 | 0.001 |
| 515.88015 | 0.001 |
| 516.10502 | 0.002 |
| 516.3299 | 0 |
| 516.5548 | 0.002 |
| 516.77972 | 0 |
| 517.00464 | 0.002 |
| 517.22958 | 0 |
| 517.45453 | 0.002 |
| 517.67949 | 0 |
| 517.90447 | 0.001 |
| 518.12946 | 0 |
| 518.35446 | 0.001 |
| 518.57947 | 0 |
| 518.8045 | 0.002 |
| 519.02954 | 0.001 |
| 519.25459 | 0.002 |
| 519.47966 | 0 |
| 519.70474 | 0.001 |
| 519.92983 | 0 |
| 520.15493 | 0.001 |
| 520.38005 | 0.001 |
| 520.60518 | 0.002 |
| 520.83033 | 0 |
| 521.05548 | 0.002 |
| 521.28065 | 0 |
| 521.50583 | 0.001 |
| 521.73103 | 0 |
| 521.95623 | 0 |
| 522.18145 | 0.002 |
| 522.40669 | 0 |
| 522.63193 | 0.002 |
| 522.85719 | 0 |
| 523.08246 | 0.001 |
| 523.30774 | 0 |
| 523.53304 | 0.001 |
| 523.75835 | 0.001 |
| 523.98367 | 0.001 |
| 524.20901 | 0 |
| 524.43436 | 0.001 |
| 524.65972 | 0.001 |
| 524.88509 | 0.002 |
| 525.11048 | 0 |
| 525.33587 | 0.001 |
| 525.56129 | 0 |
| 525.78671 | 0.001 |
| 526.01215 | 0 |
| 526.2376 | 0.001 |
| 526.46306 | -0.001 |
| 526.68853 | 0.001 |
| 526.91402 | 0 |
| 527.13952 | 0.002 |
| 527.36504 | 0.001 |
| 527.59056 | 0.002 |
| 527.8161 | 0 |
| 528.04165 | 0.001 |
| 528.26722 | 0.001 |
| 528.49279 | 0.001 |
| 528.71838 | -0.001 |
| 528.94398 | 0.002 |
| 529.1696 | 0 |
| 529.39523 | 0.001 |
| 529.62087 | 0 |
| 529.84652 | 0.001 |
| 530.07218 | -0.001 |
| 530.29786 | 0.002 |
| 530.52355 | 0 |
| 530.74926 | 0.002 |
| 530.97497 | 0.001 |
| 531.2007 | 0.002 |
| 531.42644 | 0 |
| 531.6522 | 0.001 |
| 531.87796 | -0.001 |
| 532.10374 | 0.001 |
| 532.32953 | 0 |
| 532.55534 | 0.001 |
| 532.78116 | 0 |
| 533.00698 | 0.002 |
| 533.23283 | -0.001 |
| 533.45868 | 0.001 |
| 533.68455 | 0 |
| 533.91043 | 0.001 |
| 534.13632 | 0 |
| 534.36223 | 0.001 |
| 534.58815 | 0 |
| 534.81408 | 0.001 |
| 535.04002 | 0 |
| 535.26597 | 0.001 |
| 535.49194 | 0 |
| 535.71792 | 0.001 |
| 535.94392 | 0 |
| 536.16992 | 0.002 |
| 536.39594 | -0.001 |
| 536.62197 | 0.001 |
| 536.84801 | 0.001 |
| 537.07407 | 0.001 |
| 537.30014 | 0 |
| 537.52622 | 0.001 |
| 537.75231 | 0 |
| 537.97842 | 0.001 |
| 538.20454 | 0.001 |
| 538.43067 | 0.001 |
| 538.65681 | 0 |
| 538.88297 | 0.001 |
| 539.10914 | 0.001 |
| 539.33532 | 0.001 |
| 539.56151 | 0 |
| 539.78772 | 0.002 |
| 540.01394 | 0 |
| 540.24017 | 0.001 |
| 540.46641 | 0 |
| 540.69267 | 0.001 |
| 540.91893 | 0 |
| 541.14522 | 0.001 |
| 541.37151 | 0 |
| 541.59781 | 0.001 |
| 541.82413 | 0 |
| 542.05046 | 0.001 |
| 542.27681 | 0.001 |
| 542.50316 | 0.001 |
| 542.72953 | 0 |
| 542.95591 | 0.001 |
| 543.1823 | 0 |
| 543.40871 | 0.001 |
| 543.63513 | 0 |
| 543.86156 | 0.001 |
| 544.088 | 0 |
| 544.31445 | 0.001 |
| 544.54092 | 0.001 |
| 544.7674 | 0.001 |
| 544.99389 | 0 |
| 545.2204 | 0.001 |
| 545.44691 | 0 |
| 545.67344 | 0.001 |
| 545.89999 | 0 |
| 546.12654 | 0.001 |
| 546.35311 | 0 |
| 546.57968 | 0.001 |
| 546.80628 | 0 |
| 547.03288 | 0.001 |
| 547.2595 | 0 |
| 547.48612 | 0.001 |
| 547.71276 | 0 |
| 547.93942 | 0.001 |
| 548.16608 | 0 |
| 548.39276 | 0.001 |
| 548.61945 | 0 |
| 548.84615 | 0.001 |
| 549.07287 | 0 |
| 549.29959 | 0.001 |
| 549.52633 | 0 |
| 549.75308 | 0.001 |
| 549.97985 | 0 |
| 550.20662 | 0.001 |
| 550.43341 | 0 |
| 550.66021 | 0.001 |
| 550.88703 | 0 |
| 551.11385 | 0.001 |
| 551.34069 | 0 |
| 551.56754 | 0.001 |
| 551.7944 | 0 |
| 552.02128 | 0.001 |
| 552.24816 | 0 |
| 552.47506 | 0.001 |
| 552.70197 | 0 |
| 552.9289 | 0.001 |
| 553.15583 | 0 |
| 553.38278 | 0.001 |
| 553.60974 | 0.001 |
| 553.83671 | 0.001 |
| 554.0637 | 0 |
| 554.29069 | 0.001 |
| 554.5177 | 0 |
| 554.74473 | 0.001 |
| 554.97176 | 0 |
| 555.1988 | 0.001 |
| 555.42586 | 0 |
| 555.65293 | 0.001 |
| 555.88002 | 0 |
| 556.10711 | 0.001 |
| 556.33422 | 0 |
| 556.56134 | 0.001 |
| 556.78847 | 0 |
| 557.01561 | 0.001 |
| 557.24277 | 0 |
| 557.46993 | 0.001 |
| 557.69711 | 0 |
| 557.92431 | 0.001 |
| 558.15151 | 0 |
| 558.37873 | 0.001 |
| 558.60596 | 0 |
| 558.8332 | 0.001 |
| 559.06045 | 0.001 |
| 559.28771 | 0.001 |
| 559.51499 | 0 |
| 559.74228 | 0.001 |
| 559.96958 | 0 |
| 560.1969 | 0 |
| 560.42422 | 0 |
| 560.65156 | 0.001 |
| 560.87891 | 0 |
| 561.10627 | 0.001 |
| 561.33365 | 0 |
| 561.56103 | 0.001 |
| 561.78843 | 0 |
| 562.01584 | 0.001 |
| 562.24326 | 0 |
| 562.4707 | 0 |
| 562.69815 | 0 |
| 562.9256 | 0.001 |
| 563.15308 | 0 |
| 563.38056 | 0.001 |
| 563.60805 | 0 |
| 563.83556 | 0.001 |
| 564.06308 | 0 |
| 564.29061 | 0.001 |
| 564.51815 | 0 |
| 564.74571 | 0.001 |
| 564.97328 | 0 |
| 565.20086 | 0.001 |
| 565.42845 | 0 |
| 565.65605 | 0.001 |
| 565.88367 | 0 |
| 566.11129 | 0.001 |
| 566.33893 | -0.001 |
| 566.56659 | 0.001 |
| 566.79425 | 0 |
| 567.02192 | 0.001 |
| 567.24961 | 0 |
| 567.47731 | 0.001 |
| 567.70502 | -0.001 |
| 567.93275 | 0.001 |
| 568.16048 | 0 |
| 568.38823 | 0.001 |
| 568.61599 | 0 |
| 568.84376 | 0 |
| 569.07155 | 0 |
| 569.29934 | 0 |
| 569.52715 | 0 |
| 569.75497 | 0 |
| 569.9828 | 0 |
| 570.21064 | 0.001 |
| 570.4385 | 0 |
| 570.66636 | 0.001 |
| 570.89424 | 0 |
| 571.12213 | 0.001 |
| 571.35004 | 0 |
| 571.57795 | 0 |
| 571.80588 | 0 |
| 572.03382 | 0 |
| 572.26177 | 0 |
| 572.48973 | 0.001 |
| 572.71771 | 0 |
| 572.94569 | 0.001 |
| 573.17369 | 0 |
| 573.4017 | 0 |
| 573.62972 | 0 |
| 573.85776 | 0.001 |
| 574.0858 | 0 |
| 574.31386 | 0 |
| 574.54193 | 0 |
| 574.77001 | 0.001 |
| 574.99811 | 0 |
| 575.22621 | 0 |
| 575.45433 | 0 |
| 575.68246 | 0 |
| 575.9106 | 0 |
| 576.13875 | 0.001 |
| 576.36692 | 0 |
| 576.59509 | 0.001 |
| 576.82328 | 0 |
| 577.05148 | 0.001 |
| 577.27969 | -0.001 |
| 577.50792 | 0.001 |
| 577.73615 | -0.001 |
| 577.9644 | 0.001 |
| 578.19266 | 0 |
| 578.42093 | 0.001 |
| 578.64921 | 0 |
| 578.87751 | 0.001 |
| 579.10581 | 0 |
| 579.33413 | 0.001 |
| 579.56246 | 0 |
| 579.7908 | 0.001 |
| 580.01916 | 0.001 |
| 580.24752 | 0 |
| 580.4759 | 0.001 |
| 580.70429 | -0.001 |
| 580.93269 | 0.001 |
| 581.1611 | 0 |
| 581.38952 | 0 |
| 581.61796 | 0 |
| 581.84641 | 0.001 |
| 582.07487 | 0 |
| 582.30334 | 0 |
| 582.53182 | 0 |
| 582.76032 | 0.001 |
| 582.98882 | -0.001 |
| 583.21734 | 0.001 |
| 583.44587 | 0 |
| 583.67441 | 0.001 |
| 583.90297 | 0 |
| 584.13153 | 0.001 |
| 584.36011 | 0 |
| 584.58869 | 0.001 |
| 584.81729 | 0 |
| 585.04591 | 0.001 |
| 585.27453 | 0 |
| 585.50317 | 0.001 |
| 585.73181 | 0 |
| 585.96047 | 0.001 |
| 586.18914 | -0.001 |
| 586.41782 | 0.001 |
| 586.64652 | 0 |
| 586.87522 | 0.001 |
| 587.10394 | 0 |
| 587.33267 | 0.001 |
| 587.56141 | 0 |
| 587.79016 | 0.001 |
| 588.01892 | 0 |
| 588.2477 | 0 |
| 588.47648 | 0 |
| 588.70528 | 0.001 |
| 588.93409 | -0.001 |
| 589.16291 | 0 |
| 589.39175 | 0 |
| 589.62059 | 0.001 |
| 589.84945 | 0 |
| 590.07831 | 0.001 |
| 590.30719 | 0 |
| 590.53609 | 0.001 |
| 590.76499 | 0 |
| 590.9939 | 0.001 |
| 591.22283 | -0.001 |
| 591.45177 | 0 |
| 591.68072 | 0 |
| 591.90968 | 0.001 |
| 592.13865 | 0 |
| 592.36763 | 0 |
| 592.59663 | 0 |
| 592.82563 | 0.001 |
| 593.05465 | 0 |
| 593.28368 | 0.001 |
| 593.51272 | 0 |
| 593.74178 | 0.001 |
| 593.97084 | 0 |
| 594.19992 | 0.001 |
| 594.42901 | 0 |
| 594.65811 | 0 |
| 594.88722 | 0 |
| 595.11634 | 0.001 |
| 595.34547 | 0 |
| 595.57462 | 0 |
| 595.80377 | 0 |
| 596.03294 | 0 |
| 596.26212 | 0 |
| 596.49131 | 0.001 |
| 596.72052 | 0 |
| 596.94973 | 0 |
| 597.17896 | 0 |
| 597.40819 | 0 |
| 597.63744 | 0 |
| 597.8667 | 0.001 |
| 598.09597 | 0 |
| 598.32526 | 0.001 |
| 598.55455 | 0 |
| 598.78386 | 0.001 |
| 599.01318 | 0 |
| 599.2425 | 0 |
| 599.47185 | 0 |
| 599.7012 | 0.001 |
| 599.93056 | 0 |
| 600.15993 | 0.001 |
| 600.38932 | 0 |
| 600.61872 | 0.001 |
| 600.84813 | 0 |
| 601.07755 | 0.001 |
| 601.30698 | 0 |
| 601.53642 | 0 |
| 601.76588 | 0 |
| 601.99534 | 0 |
| 602.22482 | 0 |
| 602.45431 | 0 |
| 602.68381 | 0 |
| 602.91332 | 0.001 |
| 603.14284 | 0 |
| 603.37238 | 0 |
| 603.60192 | 0 |
| 603.83148 | 0 |
| 604.06105 | 0 |
| 604.29063 | 0 |
| 604.52022 | 0 |
| 604.74982 | 0 |
| 604.97944 | 0 |
| 605.20906 | 0 |
| 605.4387 | 0 |
| 605.66835 | 0.001 |
| 605.898 | 0 |
| 606.12768 | 0 |
| 606.35736 | 0 |
| 606.58705 | 0 |
| 606.81675 | 0 |
| 607.04647 | 0.001 |
| 607.2762 | 0 |
| 607.50594 | 0.001 |
| 607.73569 | 0 |
| 607.96545 | 0 |
| 608.19522 | 0 |
| 608.425 | 0.001 |
| 608.6548 | 0 |
| 608.8846 | 0.001 |
| 609.11442 | 0 |
| 609.34425 | 0.001 |
| 609.57409 | 0 |
| 609.80394 | 0.001 |
| 610.0338 | -0.001 |
| 610.26368 | 0 |
| 610.49356 | 0 |
| 610.72346 | 0.001 |
| 610.95336 | 0 |
| 611.18328 | 0.001 |
| 611.41321 | 0 |
| 611.64315 | 0 |
| 611.87311 | 0 |
| 612.10307 | 0.001 |
| 612.33304 | 0 |
| 612.56303 | 0.001 |
| 612.79303 | 0 |
| 613.02304 | 0.001 |
| 613.25306 | 0 |
| 613.48309 | 0.001 |
| 613.71313 | 0 |
| 613.94318 | 0 |
| 614.17325 | 0 |
| 614.40332 | 0.001 |
| 614.63341 | 0 |
| 614.86351 | 0 |
| 615.09362 | 0 |
| 615.32374 | 0.001 |
| 615.55387 | -0.001 |
| 615.78401 | 0.001 |
| 616.01416 | 0 |
| 616.24433 | 0 |
| 616.4745 | 0 |
| 616.70469 | 0.001 |
| 616.93489 | -0.001 |
| 617.1651 | 0 |
| 617.39532 | 0 |
| 617.62555 | 0.001 |
| 617.85579 | 0 |
| 618.08605 | 0 |
| 618.31631 | 0 |
| 618.54659 | 0.001 |
| 618.77688 | 0 |
| 619.00717 | 0.001 |
| 619.23748 | 0 |
| 619.4678 | 0.001 |
| 619.69814 | 0 |
| 619.92848 | 0 |
| 620.15883 | 0 |
| 620.3892 | 0 |
| 620.61957 | 0 |
| 620.84996 | 0 |
| 621.08036 | 0 |
| 621.31077 | 0 |
| 621.54119 | 0 |
| 621.77162 | 0.001 |
| 622.00206 | -0.001 |
| 622.23252 | 0 |
| 622.46298 | 0 |
| 622.69345 | 0.001 |
| 622.92394 | -0.001 |
| 623.15444 | 0.001 |
| 623.38495 | 0 |
| 623.61547 | 0 |
| 623.846 | 0 |
| 624.07654 | 0 |
| 624.30709 | 0 |
| 624.53766 | 0.001 |
| 624.76823 | 0 |
| 624.99882 | 0 |
| 625.22941 | 0 |
| 625.46002 | 0 |
| 625.69064 | 0 |
| 625.92127 | 0 |
| 626.15191 | 0 |
| 626.38256 | 0.001 |
| 626.61322 | 0 |
| 626.8439 | 0.001 |
| 627.07458 | -0.001 |
| 627.30528 | 0 |
| 627.53598 | -0.001 |
| 627.7667 | 0.001 |
| 627.99743 | -0.001 |
| 628.22817 | 0 |
| 628.45892 | 0 |
| 628.68968 | 0 |
| 628.92045 | 0 |
| 629.15123 | 0.001 |
| 629.38203 | 0 |
| 629.61283 | 0 |
| 629.84365 | -0.001 |
| 630.07447 | 0.001 |
| 630.30531 | -0.001 |
| 630.53616 | 0 |
| 630.76702 | 0 |
| 630.99789 | 0 |
| 631.22877 | -0.001 |
| 631.45966 | 0 |
| 631.69057 | -0.001 |
| 631.92148 | 0 |
| 632.1524 | 0 |
| 632.38334 | 0 |
| 632.61429 | -0.001 |
| 632.84524 | 0 |
| 633.07621 | -0.001 |
| 633.30719 | 0 |
| 633.53818 | 0 |
| 633.76918 | 0 |
| 634.00019 | 0 |
| 634.23121 | 0 |
| 634.46225 | 0 |
| 634.69329 | 0.001 |
| 634.92435 | -0.001 |
| 635.15541 | 0.001 |
| 635.38649 | 0 |
| 635.61758 | 0.001 |
| 635.84867 | 0 |
| 636.07978 | 0 |
| 636.3109 | 0 |
| 636.54203 | 0.001 |
| 636.77317 | 0 |
| 637.00433 | 0 |
| 637.23549 | -0.001 |
| 637.46666 | 0.001 |
| 637.69785 | -0.001 |
| 637.92904 | 0.001 |
| 638.16025 | 0 |
| 638.39146 | 0 |
| 638.62269 | -0.001 |
| 638.85393 | 0 |
| 639.08518 | 0 |
| 639.31644 | -0.001 |
| 639.54771 | 0 |
| 639.77899 | -0.001 |
| 640.01028 | 0 |
| 640.24159 | -0.001 |
| 640.4729 | 0 |
| 640.70422 | -0.001 |
| 640.93556 | 0.001 |
| 641.1669 | -0.001 |
| 641.39826 | 0.001 |
| 641.62963 | -0.001 |
| 641.86101 | 0 |
| 642.09239 | 0 |
| 642.32379 | 0.001 |
| 642.5552 | -0.001 |
| 642.78662 | 0.001 |
| 643.01805 | -0.001 |
| 643.2495 | 0 |
| 643.48095 | -0.001 |
| 643.71241 | 0 |
| 643.94389 | -0.001 |
| 644.17537 | 0 |
| 644.40687 | -0.001 |
| 644.63837 | 0 |
| 644.86989 | -0.001 |
| 645.10142 | 0 |
| 645.33295 | -0.001 |
| 645.5645 | 0.001 |
| 645.79606 | -0.001 |
| 646.02763 | 0 |
| 646.25921 | -0.001 |
| 646.4908 | 0 |
| 646.7224 | -0.001 |
| 646.95402 | 0 |
| 647.18564 | -0.001 |
| 647.41727 | 0 |
| 647.64892 | 0 |
| 647.88057 | 0.001 |
| 648.11224 | -0.001 |
| 648.34391 | 0 |
| 648.5756 | -0.001 |
| 648.8073 | 0 |
| 649.03901 | 0 |
| 649.27072 | 0 |
| 649.50245 | -0.001 |
| 649.73419 | 0.001 |
| 649.96594 | -0.001 |
| 650.1977 | 0 |
| 650.42947 | -0.001 |
| 650.66126 | 0 |
| 650.89305 | -0.001 |
| 651.12485 | 0 |
| 651.35666 | 0 |
| 651.58849 | 0.001 |
| 651.82032 | 0 |
| 652.05217 | 0.001 |
| 652.28402 | -0.001 |
| 652.51589 | 0 |
| 652.74776 | -0.001 |
| 652.97965 | 0 |
| 653.21155 | -0.001 |
| 653.44346 | 0 |
| 653.67538 | -0.001 |
| 653.90731 | 0.001 |
| 654.13924 | -0.001 |
| 654.37119 | 0 |
| 654.60316 | -0.001 |
| 654.83513 | 0 |
| 655.06711 | -0.001 |
| 655.2991 | 0 |
| 655.5311 | 0 |
| 655.76312 | 0 |
| 655.99514 | -0.001 |
| 656.22717 | 0 |
| 656.45922 | 0 |
| 656.69127 | 0 |
| 656.92334 | -0.001 |
| 657.15541 | 0 |
| 657.3875 | 0 |
| 657.61959 | 0 |
| 657.8517 | 0 |
| 658.08382 | 0 |
| 658.31595 | -0.001 |
| 658.54809 | 0 |
| 658.78023 | -0.001 |
| 659.01239 | 0.001 |
| 659.24456 | -0.001 |
| 659.47674 | 0 |
| 659.70893 | 0 |
| 659.94113 | 0 |
| 660.17334 | 0 |
| 660.40557 | 0 |
| 660.6378 | 0 |
| 660.87004 | 0.001 |
| 661.10229 | -0.001 |
| 661.33455 | 0 |
| 661.56683 | -0.001 |
| 661.79911 | 0 |
| 662.03141 | -0.001 |
| 662.26371 | 0 |
| 662.49603 | -0.001 |
| 662.72835 | 0 |
| 662.96069 | -0.001 |
| 663.19303 | 0.001 |
| 663.42539 | -0.001 |
| 663.65775 | 0 |
| 663.89013 | -0.001 |
| 664.12252 | 0 |
| 664.35492 | 0 |
| 664.58732 | 0 |
| 664.81974 | 0 |
| 665.05217 | 0 |
| 665.28461 | 0 |
| 665.51706 | 0 |
| 665.74952 | 0 |
| 665.98199 | 0 |
| 666.21447 | -0.001 |
| 666.44696 | 0 |
| 666.67946 | 0 |
| 666.91197 | 0 |
| 667.14449 | 0 |
| 667.37702 | 0 |
| 667.60956 | -0.001 |
| 667.84211 | 0 |
| 668.07467 | 0 |
| 668.30725 | 0 |
| 668.53983 | -0.001 |
| 668.77242 | 0 |
| 669.00502 | -0.001 |
| 669.23764 | 0 |
| 669.47026 | -0.001 |
| 669.7029 | 0 |
| 669.93554 | 0 |
| 670.16819 | 0 |
| 670.40086 | -0.001 |
| 670.63353 | 0 |
| 670.86622 | 0 |
| 671.09891 | 0 |
| 671.33162 | -0.001 |
| 671.56433 | 0 |
| 671.79706 | 0 |
| 672.02979 | 0 |
| 672.26254 | 0 |
| 672.4953 | 0 |
| 672.72806 | -0.001 |
| 672.96084 | 0 |
| 673.19362 | -0.001 |
| 673.42642 | 0 |
| 673.65923 | -0.001 |
| 673.89205 | 0 |
| 674.12487 | -0.001 |
| 674.35771 | 0 |
| 674.59056 | 0 |
| 674.82342 | 0 |
| 675.05628 | 0 |
| 675.28916 | 0 |
| 675.52205 | -0.001 |
| 675.75495 | 0 |
| 675.98786 | 0 |
| 676.22077 | 0 |
| 676.4537 | -0.001 |
| 676.68664 | 0 |
| 676.91959 | -0.001 |
| 677.15255 | 0 |
| 677.38552 | -0.001 |
| 677.6185 | 0 |
| 677.85149 | -0.001 |
| 678.08449 | 0 |
| 678.3175 | 0 |
| 678.55051 | 0 |
| 678.78354 | -0.001 |
| 679.01658 | 0 |
| 679.24963 | 0 |
| 679.48269 | 0 |
| 679.71576 | -0.001 |
| 679.94884 | 0.001 |
| 680.18193 | -0.001 |
| 680.41503 | 0 |
| 680.64814 | -0.001 |
| 680.88126 | 0 |
| 681.11439 | -0.001 |
| 681.34753 | 0 |
| 681.58068 | 0 |
| 681.81384 | 0 |
| 682.04701 | 0 |
| 682.28019 | 0 |
| 682.51338 | -0.001 |
| 682.74658 | 0 |
| 682.97979 | -0.001 |
| 683.21301 | 0 |
| 683.44624 | -0.001 |
| 683.67948 | 0 |
| 683.91273 | -0.001 |
| 684.14599 | 0 |
| 684.37926 | -0.001 |
| 684.61254 | 0 |
| 684.84583 | -0.001 |
| 685.07913 | 0 |
| 685.31244 | -0.001 |
| 685.54576 | 0.001 |
| 685.77909 | -0.001 |
| 686.01243 | 0 |
| 686.24578 | -0.001 |
| 686.47914 | 0 |
| 686.71251 | -0.001 |
| 686.94589 | 0 |
| 687.17928 | 0 |
| 687.41268 | 0 |
| 687.64609 | -0.001 |
| 687.87951 | 0 |
| 688.11294 | -0.001 |
| 688.34638 | 0 |
| 688.57982 | -0.001 |
| 688.81328 | 0 |
| 689.04675 | -0.001 |
| 689.28023 | 0 |
| 689.51372 | -0.001 |
| 689.74722 | 0 |
| 689.98073 | -0.001 |
| 690.21424 | 0 |
| 690.44777 | -0.001 |
| 690.68131 | 0 |
| 690.91486 | -0.001 |
| 691.14842 | 0 |
| 691.38198 | -0.001 |
| 691.61556 | 0 |
| 691.84915 | -0.001 |
| 692.08274 | 0 |
| 692.31635 | -0.001 |
| 692.54997 | 0.001 |
| 692.78359 | -0.001 |
| 693.01723 | 0.001 |
| 693.25088 | -0.001 |
| 693.48453 | 0 |
| 693.7182 | -0.001 |
| 693.95187 | 0 |
| 694.18556 | -0.001 |
| 694.41925 | 0 |
| 694.65296 | -0.001 |
| 694.88667 | 0 |
| 695.1204 | -0.001 |
| 695.35413 | 0 |
| 695.58788 | -0.001 |
| 695.82163 | 0 |
| 696.0554 | -0.001 |
| 696.28917 | 0 |
| 696.52295 | -0.001 |
| 696.75675 | 0 |
| 696.99055 | -0.001 |
| 697.22436 | 0 |
| 697.45818 | 0 |
| 697.69202 | 0 |
| 697.92586 | -0.001 |
| 698.15971 | 0 |
| 698.39357 | 0 |
| 698.62744 | -0.001 |
| 698.86132 | 0 |
| 699.09521 | 0 |
| 699.32911 | 0 |
| 699.56302 | -0.001 |
| 699.79694 | 0 |
| 700.03087 | 0 |
| 700.26481 | 0 |
| 700.49876 | -0.001 |
| 700.73272 | 0 |
| 700.96669 | -0.001 |
| 701.20066 | 0 |
| 701.43465 | 0 |
| 701.66865 | 0 |
| 701.90266 | -0.001 |
| 702.13667 | 0 |
| 702.3707 | -0.001 |
| 702.60473 | 0.001 |
| 702.83878 | -0.001 |
| 703.07284 | 0.001 |
| 703.3069 | -0.002 |
| 703.54097 | 0.001 |
| 703.77506 | -0.001 |
| 704.00915 | 0 |
| 704.24326 | -0.001 |
| 704.47737 | 0 |
| 704.71149 | -0.001 |
| 704.94562 | 0 |
| 705.17977 | -0.002 |
| 705.41392 | 0 |
| 705.64808 | -0.001 |
| 705.88225 | 0 |
| 706.11643 | -0.001 |
| 706.35062 | 0.001 |
| 706.58482 | -0.001 |
| 706.81903 | 0 |
| 707.05325 | -0.001 |
| 707.28748 | 0 |
| 707.52171 | 0 |
| 707.75596 | 0 |
| 707.99022 | -0.001 |
| 708.22449 | 0 |
| 708.45876 | -0.001 |
| 708.69305 | 0 |
| 708.92734 | -0.001 |
| 709.16165 | 0 |
| 709.39596 | -0.001 |
| 709.63029 | 0 |
| 709.86462 | 0 |
| 710.09896 | 0.001 |
| 710.33332 | -0.001 |
| 710.56768 | 0 |
| 710.80205 | -0.001 |
| 711.03643 | 0 |
| 711.27082 | -0.001 |
| 711.50522 | 0 |
| 711.73963 | -0.001 |
| 711.97405 | 0 |
| 712.20848 | -0.001 |
| 712.44292 | 0 |
| 712.67737 | -0.001 |
| 712.91182 | 0 |
| 713.14629 | -0.001 |
| 713.38077 | 0 |
| 713.61525 | -0.001 |
| 713.84975 | 0.001 |
| 714.08425 | -0.001 |
| 714.31876 | 0 |
| 714.55329 | -0.001 |
| 714.78782 | 0 |
| 715.02236 | -0.001 |
| 715.25692 | 0.001 |
| 715.49148 | -0.001 |
| 715.72605 | 0.001 |
| 715.96063 | -0.001 |
| 716.19522 | 0 |
| 716.42982 | -0.001 |
| 716.66443 | 0 |
| 716.89904 | -0.001 |
| 717.13367 | 0 |
| 717.36831 | 0 |
| 717.60295 | 0 |
| 717.83761 | -0.001 |
| 718.07227 | 0 |
| 718.30695 | -0.001 |
| 718.54163 | 0 |
| 718.77633 | -0.001 |
| 719.01103 | 0 |
| 719.24574 | -0.001 |
| 719.48046 | 0 |
| 719.71519 | -0.001 |
| 719.94993 | 0 |
| 720.18468 | -0.001 |
| 720.41944 | 0 |
| 720.65421 | -0.001 |
| 720.88899 | 0 |
| 721.12377 | -0.001 |
| 721.35857 | 0 |
| 721.59337 | -0.001 |
| 721.82819 | 0 |
| 722.06301 | -0.001 |
| 722.29785 | 0 |
| 722.53269 | -0.001 |
| 722.76754 | 0 |
| 723.0024 | -0.001 |
| 723.23727 | 0 |
| 723.47216 | -0.001 |
| 723.70704 | 0 |
| 723.94194 | -0.001 |
| 724.17685 | 0 |
| 724.41177 | -0.001 |
| 724.6467 | 0 |
| 724.88163 | -0.001 |
| 725.11658 | 0 |
| 725.35153 | -0.001 |
| 725.58649 | 0 |
| 725.82147 | -0.001 |
| 726.05645 | 0 |
| 726.29144 | -0.001 |
| 726.52644 | 0 |
| 726.76145 | 0 |
| 726.99647 | 0 |
| 727.2315 | -0.001 |
| 727.46654 | 0 |
| 727.70158 | -0.001 |
| 727.93664 | 0 |
| 728.17171 | -0.001 |
| 728.40678 | 0 |
| 728.64187 | -0.001 |
| 728.87696 | 0 |
| 729.11206 | -0.001 |
| 729.34717 | 0 |
| 729.58229 | -0.001 |
| 729.81742 | 0 |
| 730.05256 | -0.001 |
| 730.28771 | 0 |
| 730.52287 | 0 |
| 730.75804 | 0 |
| 730.99321 | -0.001 |
| 731.2284 | 0 |
| 731.46359 | 0 |
| 731.69879 | 0 |
| 731.93401 | -0.001 |
| 732.16923 | 0.001 |
| 732.40446 | -0.001 |
| 732.6397 | 0 |
| 732.87495 | -0.001 |
| 733.11021 | 0 |
| 733.34547 | -0.001 |
| 733.58075 | 0 |
| 733.81604 | -0.001 |
| 734.05133 | 0 |
| 734.28664 | -0.001 |
| 734.52195 | 0 |
| 734.75727 | -0.001 |
| 734.9926 | 0 |
| 735.22794 | 0 |
| 735.46329 | 0 |
| 735.69865 | -0.001 |
| 735.93402 | 0 |
| 736.1694 | -0.001 |
| 736.40478 | 0 |
| 736.64018 | -0.001 |
| 736.87558 | 0 |
| 737.111 | -0.001 |
| 737.34642 | 0 |
| 737.58185 | -0.001 |
| 737.81729 | 0 |
| 738.05274 | -0.001 |
| 738.2882 | 0 |
| 738.52367 | -0.001 |
| 738.75914 | 0 |
| 738.99463 | -0.001 |
| 739.23012 | 0 |
| 739.46563 | -0.001 |
| 739.70114 | 0 |
| 739.93666 | 0 |
| 740.17219 | 0 |
| 740.40773 | 0 |
| 740.64328 | 0 |
| 740.87884 | -0.001 |
| 741.11441 | 0 |
| 741.34998 | -0.001 |
| 741.58557 | 0 |
| 741.82116 | -0.001 |
| 742.05676 | 0 |
| 742.29238 | -0.001 |
| 742.528 | 0 |
| 742.76363 | -0.001 |
| 742.99927 | 0 |
| 743.23491 | -0.001 |
| 743.47057 | 0 |
| 743.70624 | -0.001 |
| 743.94191 | 0 |
| 744.1776 | -0.001 |
| 744.41329 | 0 |
| 744.64899 | -0.001 |
| 744.8847 | 0 |
| 745.12042 | -0.001 |
| 745.35615 | 0 |
| 745.59189 | -0.001 |
| 745.82763 | 0 |
| 746.06339 | -0.001 |
| 746.29915 | 0 |
| 746.53493 | -0.001 |
| 746.77071 | 0 |
| 747.0065 | -0.001 |
| 747.2423 | 0 |
| 747.47811 | -0.001 |
| 747.71393 | 0 |
| 747.94975 | -0.001 |
| 748.18559 | 0.001 |
| 748.42143 | -0.001 |
| 748.65728 | 0 |
| 748.89315 | -0.001 |
| 749.12902 | 0 |
| 749.3649 | 0 |
| 749.60079 | 0 |
| 749.83668 | -0.001 |
| 750.07259 | 0 |
| 750.30851 | -0.001 |
| 750.54443 | 0 |
| 750.78036 | -0.001 |
| 751.0163 | 0 |
| 751.25226 | -0.001 |
| 751.48821 | 0 |
| 751.72418 | -0.001 |
| 751.96016 | 0 |
| 752.19615 | -0.001 |
| 752.43214 | 0.001 |
| 752.66814 | -0.001 |
| 752.90416 | 0 |
| 753.14018 | -0.001 |
| 753.37621 | 0 |
| 753.61225 | -0.001 |
| 753.8483 | 0 |
| 754.08435 | -0.001 |
| 754.32042 | 0 |
| 754.55649 | -0.001 |
| 754.79257 | 0 |
| 755.02867 | -0.001 |
| 755.26477 | 0 |
| 755.50087 | -0.001 |
| 755.73699 | 0 |
| 755.97312 | -0.001 |
| 756.20925 | 0 |
| 756.4454 | -0.001 |
| 756.68155 | 0 |
| 756.91771 | -0.001 |
| 757.15388 | 0 |
| 757.39006 | -0.001 |
| 757.62625 | 0 |
| 757.86245 | -0.001 |
| 758.09865 | 0 |
| 758.33487 | -0.001 |
| 758.57109 | -0.001 |
| 758.80732 | 0.001 |
| 759.04356 | -0.001 |
| 759.27981 | 0 |
| 759.51607 | 0 |
| 759.75233 | 0 |
| 759.98861 | -0.001 |
| 760.22489 | 0 |
| 760.46118 | -0.001 |
| 760.69748 | 0.001 |
| 760.93379 | 0 |
| 761.17011 | 0 |
| 761.40644 | 0 |
| 761.64278 | 0 |
| 761.87912 | -0.001 |
| 762.11547 | 0 |
| 762.35183 | -0.001 |
| 762.5882 | 0.001 |
| 762.82458 | -0.001 |
| 763.06097 | 0 |
| 763.29737 | -0.001 |
| 763.53377 | 0 |
| 763.77019 | -0.001 |
| 764.00661 | 0 |
| 764.24304 | -0.001 |
| 764.47948 | 0 |
| 764.71593 | -0.001 |
| 764.95238 | 0.001 |
| 765.18885 | -0.001 |
| 765.42532 | 0 |
| 765.6618 | -0.001 |
| 765.89829 | 0 |
| 766.13479 | -0.001 |
| 766.3713 | 0 |
| 766.60782 | -0.001 |
| 766.84434 | 0 |
| 767.08088 | -0.001 |
| 767.31742 | 0 |
| 767.55397 | 0 |
| 767.79053 | 0 |
| 768.0271 | -0.002 |
| 768.26367 | 0 |
| 768.50026 | -0.001 |
| 768.73685 | 0 |
| 768.97346 | 0 |
| 769.21007 | 0.001 |
| 769.44669 | 0 |
| 769.68331 | 0 |
| 769.91995 | 0 |
| 770.15659 | 0 |
| 770.39325 | -0.002 |
| 770.62991 | 0 |
| 770.86658 | -0.001 |
| 771.10326 | 0 |
| 771.33995 | -0.001 |
| 771.57664 | 0 |
| 771.81335 | -0.001 |
| 772.05006 | 0 |
| 772.28678 | -0.001 |
| 772.52351 | 0 |
| 772.76025 | -0.002 |
| 772.997 | 0 |
| 773.23375 | -0.001 |
| 773.47052 | 0 |
| 773.70729 | -0.001 |
| 773.94407 | 0 |
| 774.18086 | -0.002 |
| 774.41765 | 0.001 |
| 774.65446 | -0.001 |
| 774.89127 | 0 |
| 775.1281 | -0.001 |
| 775.36493 | 0 |
| 775.60177 | -0.001 |
| 775.83862 | 0 |
| 776.07547 | -0.001 |
| 776.31234 | 0 |
| 776.54921 | -0.001 |
| 776.78609 | 0 |
| 777.02298 | -0.001 |
| 777.25988 | 0.001 |
| 777.49679 | -0.001 |
| 777.7337 | 0 |
| 777.97063 | -0.001 |
| 778.20756 | 0 |
| 778.4445 | -0.001 |
| 778.68145 | 0 |
| 778.91841 | -0.001 |
| 779.15537 | 0 |
| 779.39235 | -0.001 |
| 779.62933 | 0 |
| 779.86632 | -0.001 |
| 780.10332 | 0 |
| 780.34033 | -0.001 |
| 780.57734 | 0 |
| 780.81437 | -0.001 |
| 781.0514 | 0 |
| 781.28844 | -0.001 |
| 781.52549 | 0.001 |
| 781.76255 | -0.001 |
| 781.99961 | 0 |
| 782.23669 | -0.001 |
| 782.47377 | 0 |
| 782.71086 | -0.001 |
| 782.94796 | 0 |
| 783.18507 | -0.002 |
| 783.42218 | 0 |
| 783.6593 | -0.001 |
| 783.89644 | 0 |
| 784.13358 | -0.001 |
| 784.37073 | 0 |
| 784.60788 | -0.001 |
| 784.84505 | 0 |
| 785.08222 | -0.002 |
| 785.3194 | 0 |
| 785.55659 | -0.001 |
| 785.79379 | 0 |
| 786.031 | -0.002 |
| 786.26821 | 0.001 |
| 786.50544 | -0.001 |
| 786.74267 | 0 |
| 786.97991 | -0.001 |
| 787.21716 | 0 |
| 787.45441 | -0.002 |
| 787.69168 | 0 |
| 787.92895 | -0.001 |
| 788.16623 | 0.001 |
| 788.40352 | -0.001 |
| 788.64081 | 0 |
| 788.87812 | -0.001 |
| 789.11543 | 0 |
| 789.35275 | -0.001 |
| 789.59008 | 0 |
| 789.82742 | 0 |
| 790.06477 | -0.001 |
| 790.30212 | -0.001 |
| 790.53949 | 0.001 |
| 790.77686 | -0.002 |
| 791.01424 | 0 |
| 791.25162 | -0.002 |
| 791.48902 | 0 |
| 791.72642 | -0.001 |
| 791.96383 | 0 |
| 792.20125 | -0.001 |
| 792.43868 | 0.001 |
| 792.67612 | -0.002 |
| 792.91356 | 0 |
| 793.15101 | -0.001 |
| 793.38847 | 0.001 |
| 793.62594 | -0.001 |
| 793.86342 | 0 |
| 794.1009 | -0.001 |
| 794.3384 | 0 |
| 794.5759 | -0.001 |
| 794.81341 | 0 |
| 795.05092 | -0.001 |
| 795.28845 | 0.001 |
| 795.52598 | -0.001 |
| 795.76352 | 0.001 |
| 796.00107 | -0.001 |
| 796.23863 | 0.001 |
| 796.4762 | -0.001 |
| 796.71377 | 0 |
| 796.95135 | -0.001 |
| 797.18894 | 0 |
| 797.42654 | -0.001 |
| 797.66415 | 0 |
| 797.90176 | -0.001 |
| 798.13938 | 0 |
| 798.37701 | -0.001 |
| 798.61465 | 0 |
| 798.8523 | -0.002 |
| 799.08995 | 0.001 |
| 799.32761 | -0.001 |
| 799.56528 | 0 |
| 799.80296 | -0.001 |
| 800.04065 | 0.001 |
| 800.27834 | -0.001 |
| 800.51605 | 0 |
| 800.75376 | -0.002 |
| 800.99147 | 0 |
| 801.2292 | -0.002 |
| 801.46694 | 0 |
| 801.70468 | -0.001 |
| 801.94243 | 0 |
| 802.18019 | -0.001 |
| 802.41795 | 0 |
| 802.65573 | -0.001 |
| 802.89351 | 0 |
| 803.1313 | -0.002 |
| 803.3691 | 0.001 |
| 803.6069 | -0.001 |
| 803.84472 | 0 |
| 804.08254 | -0.002 |
| 804.32037 | 0.001 |
| 804.55821 | -0.001 |
| 804.79605 | 0.001 |
| 805.03391 | -0.002 |
| 805.27177 | 0 |
| 805.50964 | -0.001 |
| 805.74752 | 0 |
| 805.9854 | -0.002 |
| 806.2233 | 0.001 |
| 806.4612 | -0.001 |
| 806.69911 | 0 |
| 806.93702 | -0.001 |
| 807.17495 | 0 |
| 807.41288 | -0.001 |
| 807.65082 | 0 |
| 807.88877 | -0.001 |
| 808.12673 | 0 |
| 808.36469 | -0.001 |
| 808.60266 | -0.001 |
| 808.84064 | -0.002 |
| 809.07863 | 0 |
| 809.31663 | -0.001 |
| 809.55463 | 0.001 |
| 809.79264 | -0.002 |
| 810.03066 | 0.001 |
| 810.26869 | -0.001 |
| 810.50672 | 0 |
| 810.74477 | -0.001 |
| 810.98282 | 0 |
| 811.22088 | -0.001 |
| 811.45894 | 0 |
| 811.69702 | -0.001 |
| 811.9351 | 0 |
| 812.17319 | -0.001 |
| 812.41129 | 0 |
| 812.64939 | -0.001 |
| 812.88751 | 0.001 |
| 813.12563 | -0.001 |
| 813.36376 | 0 |
| 813.60189 | -0.001 |
| 813.84004 | 0 |
| 814.07819 | -0.001 |
| 814.31635 | 0.001 |
| 814.55452 | -0.001 |
| 814.79269 | 0 |
| 815.03088 | -0.001 |
| 815.26907 | 0.001 |
| 815.50727 | -0.002 |
| 815.74547 | 0 |
| 815.98369 | -0.001 |
| 816.22191 | 0 |
| 816.46014 | -0.001 |
| 816.69838 | 0 |
| 816.93662 | -0.002 |
| 817.17488 | 0 |
| 817.41314 | -0.001 |
| 817.65141 | 0.001 |
| 817.88968 | -0.001 |
| 818.12797 | 0 |
| 818.36626 | -0.002 |
| 818.60456 | 0 |
| 818.84286 | -0.002 |
| 819.08118 | 0 |
| 819.3195 | 0 |
| 819.55783 | -0.001 |
| 819.79617 | 0.001 |
| 820.03451 | -0.001 |
| 820.27287 | 0 |
| 820.51123 | -0.002 |
| 820.7496 | 0 |
| 820.98797 | -0.002 |
| 821.22636 | 0.001 |
| 821.46475 | -0.002 |
| 821.70315 | 0.001 |
| 821.94155 | -0.001 |
| 822.17997 | 0.001 |
| 822.41839 | -0.001 |
| 822.65682 | 0 |
| 822.89526 | -0.001 |
| 823.1337 | 0.001 |
| 823.37216 | -0.001 |
| 823.61062 | 0 |
| 823.84908 | -0.001 |
| 824.08756 | 0 |
| 824.32604 | -0.001 |
| 824.56453 | 0.001 |
| 824.80303 | -0.001 |
| 825.04154 | 0.001 |
| 825.28005 | -0.002 |
| 825.51857 | 0.001 |
| 825.7571 | -0.001 |
| 825.99564 | 0.001 |
| 826.23418 | -0.002 |
| 826.47273 | 0 |
| 826.71129 | -0.001 |
| 826.94986 | 0 |
| 827.18843 | -0.001 |
| 827.42701 | 0 |
| 827.6656 | 0 |
| 827.9042 | 0 |
| 828.1428 | -0.001 |
| 828.38141 | 0 |
| 828.62003 | -0.001 |
| 828.85866 | 0 |
| 829.0973 | -0.001 |
| 829.33594 | 0.001 |
| 829.57459 | -0.001 |
| 829.81324 | 0.001 |
| 830.05191 | -0.001 |
| 830.29058 | 0.001 |
| 830.52926 | -0.001 |
| 830.76795 | 0 |
| 831.00664 | -0.001 |
| 831.24534 | 0.001 |
| 831.48405 | -0.001 |
| 831.72277 | 0 |
| 831.96149 | -0.001 |
| 832.20023 | -0.001 |
| 832.43897 | -0.002 |
| 832.67771 | 0 |
| 832.91647 | -0.001 |
| 833.15523 | 0 |
| 833.394 | -0.001 |
| 833.63277 | 0 |
| 833.87156 | -0.001 |
| 834.11035 | 0 |
| 834.34915 | -0.001 |
| 834.58796 | 0 |
| 834.82677 | -0.002 |
| 835.06559 | 0 |
| 835.30442 | -0.001 |
| 835.54326 | 0.001 |
| 835.7821 | -0.001 |
| 836.02095 | 0.001 |
| 836.25981 | -0.001 |
| 836.49867 | 0 |
| 836.73755 | -0.001 |
| 836.97643 | 0.001 |
| 837.21532 | -0.001 |
| 837.45421 | 0.001 |
| 837.69311 | -0.001 |
| 837.93203 | 0 |
| 838.17094 | -0.001 |
| 838.40987 | 0.001 |
| 838.6488 | -0.001 |
| 838.88774 | 0 |
| 839.12669 | -0.002 |
| 839.36564 | 0.001 |
| 839.6046 | -0.002 |
| 839.84357 | 0 |
| 840.08255 | -0.001 |
| 840.32153 | -0.001 |
| 840.56052 | -0.002 |
| 840.79952 | 0 |
| 841.03853 | -0.001 |
| 841.27754 | 0.001 |
| 841.51656 | -0.001 |
| 841.75559 | 0 |
| 841.99462 | -0.001 |
| 842.23367 | 0.001 |
| 842.47272 | -0.001 |
| 842.71177 | 0.001 |
| 842.95084 | -0.001 |
| 843.18991 | 0 |
| 843.42899 | -0.001 |
| 843.66807 | 0 |
| 843.90717 | -0.001 |
| 844.14627 | 0 |
| 844.38538 | -0.001 |
| 844.62449 | 0 |
| 844.86361 | -0.002 |
| 845.10274 | 0 |
| 845.34188 | 0 |
| 845.58102 | 0 |
| 845.82018 | -0.001 |
| 846.05934 | 0 |
| 846.2985 | -0.001 |
| 846.53767 | 0 |
| 846.77685 | -0.002 |
| 847.01604 | 0.001 |
| 847.25524 | -0.001 |
| 847.49444 | 0 |
| 847.73365 | -0.001 |
| 847.97287 | 0 |
| 848.21209 | -0.001 |
| 848.45132 | 0.001 |
| 848.69056 | -0.001 |
| 848.9298 | 0.001 |
| 849.16906 | -0.001 |
| 849.40832 | -0.001 |
| 849.64758 | -0.002 |
| 849.88686 | 0.001 |
| 850.12614 | -0.001 |
| 850.36543 | 0.001 |
| 850.60472 | -0.002 |
| 850.84403 | 0.001 |
| 851.08334 | -0.001 |
| 851.32265 | 0 |
| 851.56198 | -0.002 |
| 851.80131 | 0.001 |
| 852.04065 | -0.001 |
| 852.27999 | 0 |
| 852.51935 | -0.002 |
| 852.75871 | 0.001 |
| 852.99807 | -0.001 |
| 853.23745 | 0 |
| 853.47683 | -0.001 |
| 853.71622 | 0.001 |
| 853.95561 | -0.002 |
| 854.19502 | 0 |
| 854.43443 | -0.001 |
| 854.67384 | 0 |
| 854.91327 | -0.002 |
| 855.1527 | 0.001 |
| 855.39214 | -0.001 |
| 855.63158 | 0.001 |
| 855.87103 | -0.001 |
| 856.11049 | 0 |
| 856.34996 | -0.002 |
| 856.58943 | 0.001 |
| 856.82892 | -0.001 |
| 857.0684 | 0 |
| 857.3079 | -0.001 |
| 857.5474 | 0.001 |
| 857.78691 | -0.002 |
| 858.02642 | 0.001 |
| 858.26595 | -0.002 |
| 858.50548 | 0.001 |
| 858.74502 | -0.002 |
| 858.98456 | 0 |
| 859.22411 | -0.002 |
| 859.46367 | 0 |
| 859.70323 | -0.002 |
| 859.94281 | 0.001 |
| 860.18239 | -0.001 |
| 860.42197 | 0 |
| 860.66156 | -0.001 |
| 860.90116 | 0 |
| 861.14077 | -0.001 |
| 861.38039 | 0.001 |
| 861.62001 | -0.001 |
| 861.85964 | 0.001 |
| 862.09927 | -0.002 |
| 862.33891 | 0.001 |
| 862.57856 | -0.001 |
| 862.81822 | -0.001 |
| 863.05788 | -0.001 |
| 863.29755 | -0.001 |
| 863.53723 | -0.002 |
| 863.77691 | 0.001 |
| 864.0166 | -0.001 |
| 864.2563 | 0 |
| 864.49601 | -0.002 |
| 864.73572 | 0.001 |
| 864.97544 | -0.002 |
| 865.21516 | 0 |
| 865.45489 | -0.002 |
| 865.69463 | 0.001 |
| 865.93438 | -0.001 |
| 866.17413 | 0 |
| 866.41389 | -0.002 |
| 866.65366 | 0.001 |
| 866.89343 | -0.002 |
| 867.13321 | 0 |
| 867.373 | -0.001 |
| 867.6128 | 0.001 |
| 867.8526 | -0.002 |
| 868.09241 | 0 |
| 868.33222 | -0.002 |
| 868.57204 | 0 |
| 868.81187 | -0.001 |
| 869.05171 | 0.001 |
| 869.29155 | -0.002 |
| 869.5314 | -0.001 |
| 869.77126 | -0.002 |
| 870.01112 | 0 |
| 870.25099 | -0.001 |
| 870.49087 | 0.001 |
| 870.73075 | -0.002 |
| 870.97064 | 0 |
| 871.21054 | -0.002 |
| 871.45044 | 0 |
| 871.69035 | -0.001 |
| 871.93027 | -0.001 |
| 872.1702 | -0.003 |
| 872.41013 | 0.001 |
| 872.65007 | -0.002 |
| 872.89001 | -0.001 |
| 873.12996 | 0 |
| 873.36992 | 0.002 |
| 873.60989 | -0.002 |
| 873.84986 | 0 |
| 874.08984 | -0.001 |
| 874.32982 | 0 |
| 874.56982 | -0.002 |
| 874.80982 | 0 |
| 875.04982 | -0.003 |
| 875.28983 | 0 |
| 875.52985 | -0.002 |
| 875.76988 | 0.001 |
| 876.00991 | -0.001 |
| 876.24995 | 0.001 |
| 876.49 | -0.002 |
| 876.73005 | 0 |
| 876.97011 | -0.002 |
| 877.21018 | 0 |
| 877.45025 | -0.001 |
| 877.69033 | 0 |
| 877.93042 | -0.002 |
| 878.17051 | 0 |
| 878.41061 | -0.002 |
| 878.65072 | -0.001 |
| 878.89084 | -0.003 |
| 879.13096 | -0.001 |
| 879.37108 | -0.001 |
| 879.61122 | 0 |
| 879.85136 | -0.002 |
| 880.0915 | 0.001 |
| 880.33166 | -0.002 |
| 880.57182 | -0.002 |
| 880.81199 | 0.001 |
| 881.05216 | -0.003 |
| 881.29234 | -0.001 |
| 881.53253 | -0.003 |
| 881.77272 | 0 |
| 882.01292 | -0.002 |
| 882.25313 | 0.001 |
| 882.49334 | -0.003 |
| 882.73356 | 0.001 |
| 882.97379 | -0.001 |
| 883.21402 | 0.002 |
| 883.45426 | -0.001 |
| 883.69451 | 0.001 |
| 883.93476 | -0.002 |
| 884.17502 | 0 |
| 884.41529 | -0.002 |
| 884.65556 | 0.002 |
| 884.89584 | -0.003 |
| 885.13613 | 0 |
| 885.37642 | -0.001 |
| 885.61672 | 0.001 |
| 885.85703 | -0.004 |
| 886.09734 | 0 |
| 886.33766 | -0.002 |
| 886.57799 | 0 |
| 886.81832 | -0.005 |
| 887.05866 | 0.002 |
| 887.29901 | -0.003 |
| 887.53936 | -0.001 |
| 887.77972 | -0.003 |
| 888.02008 | 0.002 |
| 888.26045 | -0.002 |
| 888.50083 | 0.001 |
| 888.74122 | -0.003 |
| 888.98161 | 0 |
| 889.22201 | -0.003 |
| 889.46241 | 0 |
| 889.70282 | -0.003 |
| 889.94324 | 0 |
| 890.18366 | -0.001 |
| 890.42409 | 0 |
| 890.66453 | -0.003 |
| 890.90497 | -0.001 |
| 891.14542 | -0.004 |
| 891.38588 | 0.001 |
| 891.62634 | -0.005 |
| 891.86681 | 0.001 |
| 892.10729 | -0.002 |
| 892.34777 | 0.001 |
| 892.58826 | -0.002 |
| 892.82876 | 0.001 |
| 893.06926 | -0.004 |
| 893.30977 | 0.001 |
| 893.55028 | -0.002 |
| 893.7908 | 0.001 |
| 894.03133 | -0.003 |
| 894.27186 | 0.001 |
| 894.51241 | -0.003 |
| 894.75295 | 0.001 |
| 894.99351 | -0.002 |
| 895.23407 | -0.001 |
| 895.47463 | -0.002 |
| 895.7152 | 0.001 |
| 895.95578 | -0.002 |
| 896.19637 | 0.001 |
| 896.43696 | -0.002 |
| 896.67756 | 0.001 |
| 896.91816 | -0.002 |
| 897.15878 | 0 |
| 897.39939 | -0.004 |
| 897.64002 | -0.001 |
| 897.88065 | -0.002 |
| 898.12128 | 0 |
| 898.36193 | -0.003 |
| 898.60258 | -0.001 |
| 898.84323 | -0.003 |
| 899.08389 | 0 |
| 899.32456 | -0.002 |
| 899.56524 | 0 |
| 899.80592 | -0.003 |
| 900.04661 | 0.002 |
| 900.2873 | -0.003 |
| 900.528 | 0.001 |
| 900.76871 | -0.005 |
| 901.00942 | -0.001 |
| 901.25014 | -0.002 |
| 901.49087 | 0 |
| 901.7316 | -0.002 |
| 901.97234 | 0 |
| 902.21308 | -0.004 |
| 902.45383 | 0.002 |
| 902.69459 | -0.003 |
| 902.93535 | 0.001 |
| 903.17612 | -0.004 |
| 903.4169 | 0.001 |
| 903.65768 | -0.002 |
| 903.89847 | 0.002 |
| 904.13926 | -0.004 |
| 904.38006 | 0 |
| 904.62087 | -0.004 |
| 904.86169 | 0 |
| 905.10251 | -0.004 |
| 905.34333 | 0 |
| 905.58416 | -0.001 |
| 905.825 | 0.001 |
| 906.06585 | -0.002 |
| 906.3067 | 0.001 |
| 906.54756 | -0.004 |
| 906.78842 | 0.001 |
| 907.02929 | -0.003 |
| 907.27017 | 0 |
| 907.51105 | -0.002 |
| 907.75194 | 0 |
| 907.99283 | -0.001 |
| 908.23373 | 0 |
| 908.47464 | -0.003 |
| 908.71555 | 0 |
| 908.95647 | -0.004 |
| 909.1974 | 0.002 |
| 909.43833 | -0.004 |
| 909.67927 | 0 |
| 909.92021 | -0.002 |
| 910.16116 | 0 |
| 910.40212 | -0.002 |
| 910.64308 | 0.001 |
| 910.88405 | -0.004 |
| 911.12503 | 0.002 |
| 911.36601 | -0.005 |
| 911.607 | 0.001 |
| 911.84799 | -0.002 |
| 912.08899 | 0.001 |
| 912.33 | -0.004 |
| 912.57101 | 0.001 |
| 912.81203 | -0.004 |
| 913.05305 | -0.001 |
| 913.29408 | -0.002 |
| 913.53512 | 0.001 |
| 913.77616 | -0.002 |
| 914.01721 | 0.001 |
| 914.25827 | -0.004 |
| 914.49933 | 0 |
| 914.74039 | -0.003 |
| 914.98147 | 0.001 |
| 915.22255 | -0.002 |
| 915.46363 | 0.001 |
| 915.70472 | -0.004 |
| 915.94582 | 0 |
| 916.18693 | -0.003 |
| 916.42804 | 0.001 |
| 916.66915 | -0.004 |
| 916.91027 | 0.001 |
| 917.1514 | -0.003 |
| 917.39254 | 0.001 |
| 917.63368 | -0.005 |
| 917.87482 | 0 |
| 918.11597 | -0.003 |
| 918.35713 | 0 |
| 918.5983 | -0.004 |
| 918.83947 | 0.003 |
| 919.08064 | -0.005 |
| 919.32183 | 0 |
| 919.56301 | -0.004 |
| 919.80421 | 0.001 |
| 920.04541 | -0.002 |
| 920.28662 | 0.002 |
| 920.52783 | -0.003 |
| 920.76905 | -0.001 |
| 921.01027 | -0.003 |
| 921.2515 | 0.001 |
| 921.49274 | -0.005 |
| 921.73398 | -0.001 |
| 921.97523 | -0.004 |
| 922.21648 | 0 |
| 922.45774 | -0.002 |
| 922.69901 | -0.001 |
| 922.94028 | -0.003 |
| 923.18156 | 0.001 |
| 923.42285 | -0.005 |
| 923.66414 | 0.001 |
| 923.90543 | -0.004 |
| 924.14673 | -0.001 |
| 924.38804 | -0.002 |
| 924.62936 | -0.001 |
| 924.87068 | -0.003 |
| 925.112 | 0 |
| 925.35333 | -0.004 |
| 925.59467 | 0.001 |
| 925.83602 | -0.004 |
| 926.07737 | 0 |
| 926.31872 | -0.003 |
| 926.56008 | 0 |
| 926.80145 | -0.003 |
| 927.04282 | 0.001 |
| 927.2842 | -0.002 |
| 927.52559 | 0.002 |
| 927.76698 | -0.003 |
| 928.00837 | 0.001 |
| 928.24978 | -0.005 |
| 928.49119 | 0.002 |
| 928.7326 | -0.004 |
| 928.97402 | 0.002 |
| 929.21545 | -0.003 |
| 929.45688 | 0 |
| 929.69832 | -0.002 |
| 929.93976 | 0.001 |
| 930.18121 | -0.004 |
| 930.42267 | -0.001 |
| 930.66413 | -0.003 |
| 930.90559 | 0 |
| 931.14707 | -0.004 |
| 931.38855 | 0 |
| 931.63003 | -0.004 |
| 931.87152 | 0 |
| 932.11302 | -0.002 |
| 932.35452 | 0 |
| 932.59603 | -0.003 |
| 932.83754 | 0.001 |
| 933.07906 | -0.002 |
| 933.32059 | 0.001 |
| 933.56212 | -0.003 |
| 933.80365 | -0.002 |
| 934.0452 | -0.004 |
| 934.28674 | 0.001 |
| 934.5283 | -0.006 |
| 934.76986 | 0.001 |
| 935.01142 | -0.003 |
| 935.253 | 0.001 |
| 935.49457 | -0.005 |
| 935.73616 | -0.002 |
| 935.97774 | -0.006 |
| 936.21934 | 0.001 |
| 936.46094 | -0.004 |
| 936.70254 | 0 |
| 936.94416 | -0.007 |
| 937.18577 | 0.001 |
| 937.4274 | -0.006 |
| 937.66903 | 0 |
| 937.91066 | -0.006 |
| 938.1523 | 0 |
| 938.39395 | -0.006 |
| 938.6356 | 0.002 |
| 938.87726 | -0.004 |
| 939.11892 | -0.001 |
| 939.36059 | -0.004 |
| 939.60226 | 0 |
| 939.84394 | -0.006 |
| 940.08563 | 0.001 |
| 940.32732 | -0.004 |
| 940.56902 | 0.002 |
| 940.81072 | -0.005 |
| 941.05243 | 0.001 |
| 941.29414 | -0.006 |
| 941.53586 | 0.003 |
| 941.77759 | -0.01 |
| 942.01932 | 0 |
| 942.26106 | 0.001 |
| 942.5028 | -0.004 |
| 942.74455 | 0.003 |
| 942.9863 | -0.003 |
| 943.22806 | -0.003 |
| 943.46983 | -0.008 |
| 943.7116 | -0.002 |
| 943.95337 | -0.004 |
| 944.19516 | 0.001 |
| 944.43694 | -0.004 |
| 944.67874 | -0.001 |
| 944.92054 | -0.003 |
| 945.16234 | 0 |
| 945.40415 | -0.004 |
| 945.64596 | 0.002 |
| 945.88779 | -0.005 |
| 946.12961 | 0.002 |
| 946.37145 | -0.007 |
| 946.61328 | 0.004 |
| 946.85513 | -0.008 |
| 947.09698 | 0 |
| 947.33883 | -0.006 |
| 947.58069 | 0.001 |
| 947.82256 | -0.005 |
| 948.06443 | 0.002 |
| 948.3063 | -0.006 |
| 948.54819 | 0.002 |
| 948.79007 | -0.006 |
| 949.03197 | 0.001 |
| 949.27387 | -0.005 |
| 949.51577 | 0.002 |
| 949.75768 | -0.006 |
| 949.9996 | -0.001 |
| 950.24152 | -0.006 |
| 950.48344 | 0.002 |
| 950.72538 | -0.005 |
| 950.96731 | -0.001 |
| 951.20926 | -0.01 |
| 951.45121 | -0.002 |
| 951.69316 | -0.006 |
| 951.93512 | 0.002 |
| 952.17708 | -0.006 |
| 952.41906 | 0 |
| 952.66103 | -0.008 |
| 952.90301 | 0.004 |
| 953.145 | -0.004 |
| 953.38699 | -0.001 |
| 953.62899 | -0.006 |
| 953.87099 | -0.001 |
| 954.113 | -0.004 |
| 954.35502 | 0 |
| 954.59704 | -0.003 |
| 954.83906 | 0 |
| 955.08109 | -0.009 |
| 955.32313 | 0.002 |
| 955.56517 | -0.004 |
| 955.80722 | 0 |
| 956.04927 | -0.002 |
| 956.29133 | 0.001 |
| 956.53339 | -0.004 |
| 956.77546 | 0.001 |
| 957.01753 | -0.003 |
| 957.25961 | 0.001 |
| 957.5017 | -0.007 |
| 957.74379 | 0.002 |
| 957.98588 | -0.004 |
| 958.22798 | -0.001 |
| 958.47009 | -0.008 |
| 958.7122 | 0.002 |
| 958.95432 | -0.003 |
| 959.19644 | -0.001 |
| 959.43857 | -0.004 |
| 959.6807 | 0.003 |
| 959.92284 | -0.004 |
| 960.16498 | 0.003 |
| 960.40713 | -0.004 |
| 960.64929 | 0.002 |
| 960.89145 | -0.007 |
| 961.13361 | 0 |
| 961.37578 | -0.005 |
| 961.61796 | 0.001 |
| 961.86014 | -0.004 |
| 962.10233 | -0.002 |
| 962.34452 | -0.006 |
| 962.58671 | -0.001 |
| 962.82892 | -0.004 |
| 963.07112 | -0.001 |
| 963.31334 | -0.007 |
| 963.55556 | 0.002 |
| 963.79778 | -0.003 |
| 964.04001 | 0.001 |
| 964.28224 | -0.007 |
| 964.52448 | -0.001 |
| 964.76673 | -0.005 |
| 965.00898 | 0.004 |
| 965.25123 | -0.004 |
| 965.49349 | 0.001 |
| 965.73576 | -0.006 |
| 965.97803 | -0.001 |
| 966.22031 | -0.004 |
| 966.46259 | 0.002 |
| 966.70488 | -0.005 |
| 966.94717 | 0 |
| 967.18946 | -0.004 |
| 967.43177 | -0.003 |
| 967.67408 | -0.005 |
| 967.91639 | 0 |
| 968.15871 | -0.007 |
| 968.40103 | 0.002 |
| 968.64336 | -0.003 |
| 968.88569 | 0.003 |
| 969.12803 | -0.006 |
| 969.37038 | 0.001 |
| 969.61273 | -0.005 |
| 969.85508 | 0.003 |
| 970.09744 | -0.006 |
| 970.3398 | 0.005 |
| 970.58218 | -0.004 |
| 970.82455 | -0.002 |
| 971.06693 | -0.005 |
| 971.30932 | 0.001 |
| 971.55171 | -0.003 |
| 971.7941 | 0 |
| 972.03651 | -0.008 |
| 972.27891 | 0 |
| 972.52132 | -0.006 |
| 972.76374 | 0.002 |
| 973.00616 | -0.008 |
| 973.24859 | 0.001 |
| 973.49102 | -0.004 |
| 973.73346 | 0.004 |
| 973.9759 | -0.007 |
| 974.21835 | 0.001 |
| 974.4608 | -0.008 |
| 974.70326 | 0.003 |
| 974.94572 | -0.007 |
| 975.18819 | 0 |
| 975.43066 | -0.008 |
| 975.67314 | -0.001 |
| 975.91562 | -0.006 |
| 976.15811 | -0.001 |
| 976.40061 | -0.001 |
| 976.6431 | 0.001 |
| 976.88561 | -0.008 |
| 977.12812 | 0.002 |
| 977.37063 | -0.006 |
| 977.61315 | 0.002 |
| 977.85567 | -0.006 |
| 978.0982 | 0.004 |
| 978.34074 | -0.008 |
| 978.58327 | 0 |
| 978.82582 | -0.005 |
| 979.06837 | 0.001 |
| 979.31092 | -0.008 |
| 979.55348 | 0.003 |
| 979.79604 | -0.006 |
| 980.03861 | 0.002 |
| 980.28119 | -0.004 |
| 980.52377 | -0.002 |
| 980.76635 | -0.005 |
| 981.00894 | 0 |
| 981.25154 | -0.004 |
| 981.49413 | -0.002 |
| 981.73674 | -0.007 |
| 981.97935 | 0 |
| 982.22196 | 0 |
| 982.46458 | 0.002 |
| 982.70721 | -0.003 |
| 982.94983 | 0.001 |
| 983.19247 | -0.009 |
| 983.43511 | -0.001 |
| 983.67775 | -0.003 |
| 983.9204 | 0 |
| 984.16306 | -0.005 |
| 984.40571 | -0.001 |
| 984.64838 | -0.008 |
| 984.89105 | 0.004 |
| 985.13372 | -0.006 |
| 985.3764 | 0.003 |
| 985.61908 | -0.004 |
| 985.86177 | 0.003 |
| 986.10447 | -0.007 |
| 986.34716 | 0.001 |
| 986.58987 | -0.007 |
| 986.83258 | 0.004 |
| 987.07529 | -0.009 |
| 987.31801 | -0.001 |
| 987.56073 | -0.004 |
| 987.80346 | -0.001 |
| 988.04619 | -0.006 |
| 988.28893 | -0.004 |
| 988.53167 | -0.01 |
| 988.77442 | 0 |
| 989.01717 | -0.008 |
| 989.25993 | 0.002 |
| 989.50269 | -0.01 |
| 989.74546 | 0.001 |
| 989.98823 | -0.011 |
| 990.23101 | 0.002 |
| 990.47379 | -0.006 |
| 990.71657 | 0.004 |
| 990.95937 | -0.008 |
| 991.20216 | 0.005 |
| 991.44496 | -0.007 |
| 991.68777 | -0.001 |
| 991.93058 | -0.009 |
| 992.17339 | 0.007 |
| 992.41621 | -0.006 |
| 992.65904 | 0.002 |
| 992.90187 | -0.005 |
| 993.1447 | 0 |
| 993.38754 | -0.009 |
| 993.63039 | 0.001 |
| 993.87324 | -0.011 |
| 994.11609 | 0 |
| 994.35895 | -0.006 |
| 994.60181 | -0.001 |
| 994.84468 | -0.008 |
| 995.08755 | 0.004 |
| 995.33043 | -0.007 |
| 995.57331 | -0.002 |
| 995.8162 | -0.009 |
| 996.05909 | 0.005 |
| 996.30199 | -0.007 |
| 996.54489 | -0.002 |
| 996.7878 | -0.01 |
| 997.03071 | 0.005 |
| 997.27363 | -0.005 |
| 997.51655 | 0.002 |
| 997.75947 | -0.003 |
| 998.0024 | -0.001 |
| 998.24534 | -0.009 |
| 998.48828 | -0.002 |
| 998.73122 | -0.009 |
| 998.97417 | 0.004 |
| 999.21712 | -0.006 |
| 999.46008 | 0 |
| 999.70304 | -0.01 |
| 999.94601 | 0.007 |
| 1000.18898 | -0.008 |
| 1000.43196 | 0.004 |
| 1000.67494 | -0.007 |
| 1000.91793 | 0.006 |
| 1001.16092 | -0.015 |
| 1001.40392 | -0.002 |
| 1001.64692 | -0.002 |
| 1001.88992 | 0.006 |
| 1002.13293 | -0.011 |
| 1002.37595 | 0.007 |
| 1002.61897 | -0.006 |
| 1002.86199 | 0 |
| 1003.10502 | -0.013 |
| 1003.34805 | 0.001 |
| 1003.59109 | -0.013 |
| 1003.83413 | 0.007 |
| 1004.07718 | -0.01 |
| 1004.32023 | -0.012 |
| 1004.56329 | 0.007 |
| 1004.80635 | -0.01 |
| 1005.04941 | 0.001 |
| 1005.29248 | -0.009 |
| 1005.53556 | -0.005 |
| 1005.77864 | -0.014 |
| 1006.02172 | 0.002 |
| 1006.26481 | -0.017 |
| 1006.5079 | 0.008 |
| 1006.751 | -0.014 |
| 1006.9941 | 0.007 |
| 1007.23721 | -0.009 |
| 1007.48032 | 0.006 |
| 1007.72344 | -0.008 |
| 1007.96656 | 0.005 |
| 1008.20968 | -0.005 |
| 1008.45281 | -0.005 |
| 1008.69595 | -0.009 |
| 1008.93909 | -0.001 |
| 1009.18223 | -0.015 |
| 1009.42538 | 0.006 |
| 1009.66853 | -0.011 |
| 1009.91169 | -0.005 |
| 1010.15485 | -0.016 |
| 1010.39801 | -0.001 |
| 1010.64118 | -0.018 |
| 1010.88436 | 0.008 |
| 1011.12754 | -0.01 |
| 1011.37072 | 0.003 |
| 1011.61391 | -0.017 |
| 1011.8571 | 0.005 |
| 1012.1003 | -0.014 |
| 1012.3435 | -0.001 |
| 1012.58671 | -0.023 |
| 1012.82992 | 0.003 |
| 1013.07314 | -0.006 |
| 1013.31636 | 0.005 |
| 1013.55958 | -0.016 |
| 1013.80281 | -0.002 |
| 1014.04604 | -0.014 |
| 1014.28928 | -0.003 |
| 1014.53252 | -0.012 |
| 1014.77577 | 0.001 |
| 1015.01902 | -0.023 |
| 1015.26228 | -0.004 |
| 1015.50554 | -0.016 |
| 1015.7488 | 0.003 |
| 1015.99207 | -0.011 |
| 1016.23535 | 0.008 |
| 1016.47862 | -0.013 |
| 1016.72191 | -0.005 |
| 1016.96519 | -0.012 |
| 1017.20848 | 0 |
| 1017.45178 | -0.014 |
| 1017.69508 | 0.011 |
| 1017.93838 | -0.023 |
| 1018.18169 | 0.011 |
| 1018.425 | -0.01 |
| 1018.66832 | 0.002 |
| 1018.91164 | -0.022 |
| 1019.15497 | 0.003 |
| 1019.3983 | -0.016 |
| 1019.64164 | -0.002 |
| 1019.88498 | -0.02 |
| 1020.12832 | -0.01 |
| 1020.37167 | -0.021 |
| 1020.61502 | 0.011 |
| 1020.85838 | -0.02 |
| 1021.10174 | 0.009 |
| 1021.3451 | -0.023 |
| 1021.58847 | 0.006 |
| 1021.83185 | 0 |
| 1022.07523 | 0 |
| 1022.31861 | 0 |
| 1022.562 | 0 |
| 1022.80539 | 0 |
| 1023.04878 | 0 |
| 1023.29218 | 0 |
| 1023.53559 | 0 |
| 1023.779 | 0 |
| 1024.02241 | 0 |
| 1024.26583 | 0 |
| 1024.50925 | 0 |
| 1024.75268 | 0 |
| 1024.99611 | 0 |
| 1025.23954 | 0 |
| 1025.48298 | 0 |
| 1025.72642 | 0 |
| 1025.96987 | 0 |
| 1026.21332 | 0 |
| 1026.45678 | 0 |
| 1026.70024 | 0 |
| 1026.9437 | 0 |
| 1027.18717 | 0 |
| 1027.43064 | 0 |